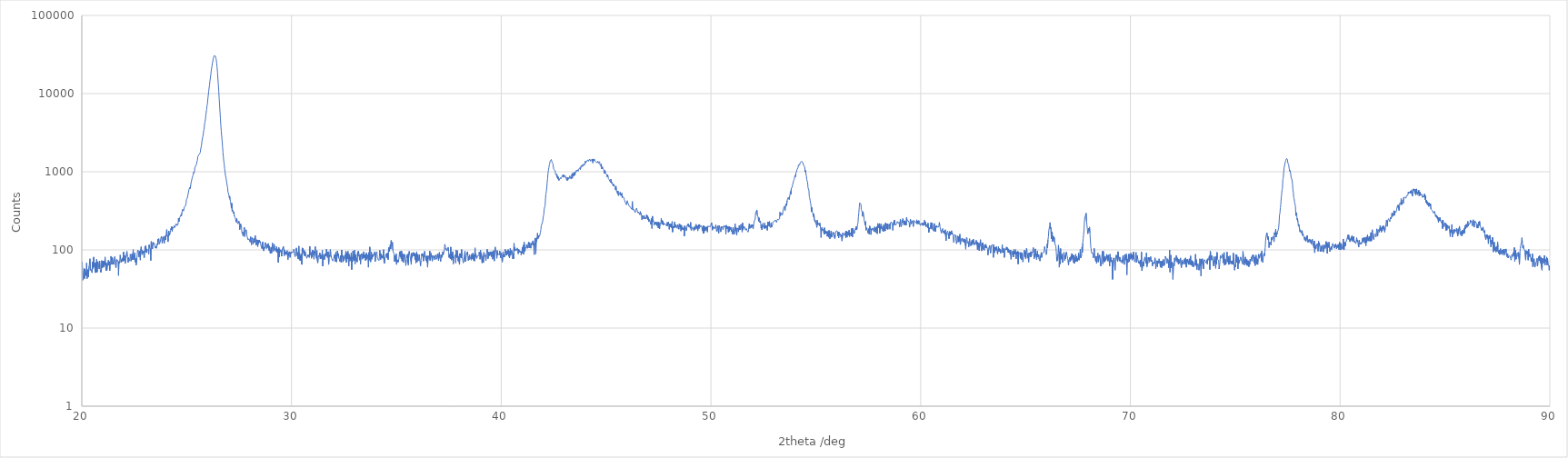
| Category | [Measurement conditions] |
|---|---|
| 20.01 | 71 |
| 20.03 | 64 |
| 20.05 | 41 |
| 20.07 | 43 |
| 20.09 | 53 |
| 20.11 | 58 |
| 20.13 | 43 |
| 20.15 | 57 |
| 20.17 | 56 |
| 20.19 | 47 |
| 20.21 | 52 |
| 20.23 | 68 |
| 20.25 | 43 |
| 20.27 | 50 |
| 20.29 | 56 |
| 20.31 | 45 |
| 20.33 | 44 |
| 20.35 | 62 |
| 20.37 | 62 |
| 20.39 | 77 |
| 20.41 | 55 |
| 20.43 | 57 |
| 20.45 | 55 |
| 20.47 | 55 |
| 20.49 | 51 |
| 20.51 | 70 |
| 20.53 | 58 |
| 20.55 | 58 |
| 20.57 | 81 |
| 20.59 | 61 |
| 20.61 | 68 |
| 20.63 | 54 |
| 20.65 | 51 |
| 20.67 | 69 |
| 20.69 | 52 |
| 20.71 | 76 |
| 20.73 | 52 |
| 20.75 | 69 |
| 20.77 | 71 |
| 20.79 | 62 |
| 20.81 | 59 |
| 20.83 | 57 |
| 20.85 | 72 |
| 20.87 | 60 |
| 20.89 | 52 |
| 20.91 | 54 |
| 20.93 | 52 |
| 20.95 | 73 |
| 20.97 | 70 |
| 20.99 | 59 |
| 21.01 | 59 |
| 21.03 | 72 |
| 21.05 | 61 |
| 21.07 | 71 |
| 21.09 | 64 |
| 21.11 | 81 |
| 21.13 | 64 |
| 21.15 | 54 |
| 21.17 | 68 |
| 21.19 | 54 |
| 21.21 | 58 |
| 21.23 | 61 |
| 21.25 | 71 |
| 21.27 | 74 |
| 21.29 | 64 |
| 21.31 | 71 |
| 21.33 | 54 |
| 21.35 | 61 |
| 21.37 | 67 |
| 21.39 | 83 |
| 21.41 | 72 |
| 21.43 | 65 |
| 21.45 | 80 |
| 21.47 | 77 |
| 21.49 | 71 |
| 21.51 | 65 |
| 21.53 | 71 |
| 21.55 | 70 |
| 21.57 | 82 |
| 21.59 | 76 |
| 21.61 | 62 |
| 21.63 | 59 |
| 21.65 | 75 |
| 21.67 | 74 |
| 21.69 | 76 |
| 21.71 | 74 |
| 21.73 | 70 |
| 21.75 | 47 |
| 21.77 | 71 |
| 21.79 | 68 |
| 21.81 | 72 |
| 21.83 | 86 |
| 21.85 | 77 |
| 21.87 | 69 |
| 21.89 | 68 |
| 21.91 | 76 |
| 21.93 | 72 |
| 21.95 | 79 |
| 21.97 | 71 |
| 21.99 | 94 |
| 22.01 | 73 |
| 22.03 | 85 |
| 22.05 | 81 |
| 22.07 | 67 |
| 22.09 | 78 |
| 22.11 | 77 |
| 22.13 | 76 |
| 22.15 | 96 |
| 22.17 | 82 |
| 22.19 | 76 |
| 22.21 | 69 |
| 22.23 | 80 |
| 22.25 | 75 |
| 22.27 | 75 |
| 22.29 | 72 |
| 22.31 | 88 |
| 22.33 | 85 |
| 22.35 | 72 |
| 22.37 | 80 |
| 22.39 | 89 |
| 22.41 | 75 |
| 22.43 | 88 |
| 22.45 | 101 |
| 22.47 | 75 |
| 22.49 | 83 |
| 22.51 | 81 |
| 22.53 | 92 |
| 22.55 | 70 |
| 22.57 | 77 |
| 22.59 | 64 |
| 22.61 | 63 |
| 22.63 | 79 |
| 22.65 | 93 |
| 22.67 | 100 |
| 22.69 | 95 |
| 22.71 | 92 |
| 22.73 | 81 |
| 22.75 | 97 |
| 22.77 | 87 |
| 22.79 | 74 |
| 22.81 | 102 |
| 22.83 | 110 |
| 22.85 | 97 |
| 22.87 | 87 |
| 22.89 | 98 |
| 22.91 | 93 |
| 22.93 | 90 |
| 22.95 | 97 |
| 22.97 | 79 |
| 22.99 | 83 |
| 23.01 | 110 |
| 23.03 | 94 |
| 23.05 | 114 |
| 23.07 | 115 |
| 23.09 | 92 |
| 23.11 | 102 |
| 23.13 | 100 |
| 23.15 | 104 |
| 23.17 | 98 |
| 23.19 | 88 |
| 23.21 | 116 |
| 23.23 | 107 |
| 23.25 | 109 |
| 23.27 | 103 |
| 23.29 | 73 |
| 23.31 | 128 |
| 23.33 | 119 |
| 23.35 | 121 |
| 23.37 | 103 |
| 23.39 | 125 |
| 23.41 | 126 |
| 23.43 | 118 |
| 23.45 | 122 |
| 23.47 | 125 |
| 23.49 | 120 |
| 23.51 | 106 |
| 23.53 | 111 |
| 23.55 | 105 |
| 23.57 | 113 |
| 23.59 | 119 |
| 23.61 | 115 |
| 23.63 | 137 |
| 23.65 | 131 |
| 23.67 | 139 |
| 23.69 | 119 |
| 23.71 | 119 |
| 23.73 | 124 |
| 23.75 | 125 |
| 23.77 | 126 |
| 23.79 | 149 |
| 23.81 | 140 |
| 23.83 | 122 |
| 23.85 | 133 |
| 23.87 | 147 |
| 23.89 | 136 |
| 23.91 | 139 |
| 23.93 | 121 |
| 23.95 | 150 |
| 23.97 | 147 |
| 23.99 | 134 |
| 24.01 | 154 |
| 24.03 | 149 |
| 24.05 | 182 |
| 24.07 | 159 |
| 24.09 | 154 |
| 24.11 | 127 |
| 24.13 | 139 |
| 24.15 | 175 |
| 24.17 | 153 |
| 24.19 | 157 |
| 24.21 | 163 |
| 24.23 | 178 |
| 24.25 | 188 |
| 24.27 | 180 |
| 24.29 | 199 |
| 24.31 | 173 |
| 24.33 | 192 |
| 24.35 | 188 |
| 24.37 | 194 |
| 24.39 | 192 |
| 24.41 | 203 |
| 24.43 | 194 |
| 24.45 | 195 |
| 24.47 | 206 |
| 24.49 | 215 |
| 24.51 | 211 |
| 24.53 | 205 |
| 24.55 | 214 |
| 24.57 | 208 |
| 24.59 | 214 |
| 24.61 | 255 |
| 24.63 | 230 |
| 24.65 | 246 |
| 24.67 | 258 |
| 24.69 | 268 |
| 24.71 | 261 |
| 24.73 | 281 |
| 24.75 | 272 |
| 24.77 | 299 |
| 24.79 | 299 |
| 24.81 | 332 |
| 24.83 | 327 |
| 24.85 | 314 |
| 24.87 | 332 |
| 24.89 | 356 |
| 24.91 | 359 |
| 24.93 | 359 |
| 24.95 | 367 |
| 24.97 | 394 |
| 24.99 | 442 |
| 25.01 | 431 |
| 25.03 | 460 |
| 25.05 | 486 |
| 25.07 | 481 |
| 25.09 | 555 |
| 25.11 | 591 |
| 25.13 | 605 |
| 25.15 | 633 |
| 25.17 | 609 |
| 25.19 | 668 |
| 25.21 | 725 |
| 25.23 | 762 |
| 25.25 | 807 |
| 25.27 | 849 |
| 25.29 | 879 |
| 25.31 | 917 |
| 25.33 | 984 |
| 25.35 | 957 |
| 25.37 | 996 |
| 25.39 | 1117 |
| 25.41 | 1117 |
| 25.43 | 1198 |
| 25.45 | 1203 |
| 25.47 | 1243 |
| 25.49 | 1343 |
| 25.51 | 1389 |
| 25.53 | 1553 |
| 25.55 | 1524 |
| 25.57 | 1638 |
| 25.59 | 1653 |
| 25.61 | 1638 |
| 25.63 | 1721 |
| 25.65 | 1781 |
| 25.67 | 1957 |
| 25.69 | 2071 |
| 25.71 | 2221 |
| 25.73 | 2484 |
| 25.75 | 2547 |
| 25.77 | 2821 |
| 25.79 | 2992 |
| 25.81 | 3332 |
| 25.83 | 3493 |
| 25.85 | 3984 |
| 25.87 | 4290 |
| 25.89 | 4614 |
| 25.91 | 5135 |
| 25.93 | 5702 |
| 25.95 | 6243 |
| 25.97 | 6972 |
| 25.99 | 7399 |
| 26.01 | 8545 |
| 26.03 | 9480 |
| 26.05 | 10679 |
| 26.07 | 11734 |
| 26.09 | 12913 |
| 26.11 | 14489 |
| 26.13 | 15764 |
| 26.15 | 17408 |
| 26.17 | 19461 |
| 26.19 | 21064 |
| 26.21 | 22803 |
| 26.23 | 24775 |
| 26.25 | 26191 |
| 26.27 | 28034 |
| 26.29 | 29569 |
| 26.31 | 30521 |
| 26.33 | 30816 |
| 26.35 | 31015 |
| 26.37 | 30137 |
| 26.39 | 28872 |
| 26.41 | 27304 |
| 26.43 | 24660 |
| 26.45 | 21911 |
| 26.47 | 18752 |
| 26.49 | 15746 |
| 26.51 | 13172 |
| 26.53 | 10747 |
| 26.55 | 8644 |
| 26.57 | 7068 |
| 26.59 | 5837 |
| 26.61 | 4757 |
| 26.63 | 3893 |
| 26.65 | 3282 |
| 26.67 | 2836 |
| 26.69 | 2488 |
| 26.71 | 2101 |
| 26.73 | 1784 |
| 26.75 | 1542 |
| 26.77 | 1366 |
| 26.79 | 1253 |
| 26.81 | 1099 |
| 26.83 | 1005 |
| 26.85 | 896 |
| 26.87 | 849 |
| 26.89 | 790 |
| 26.91 | 727 |
| 26.93 | 737 |
| 26.95 | 628 |
| 26.97 | 552 |
| 26.99 | 539 |
| 27.01 | 509 |
| 27.03 | 468 |
| 27.05 | 487 |
| 27.07 | 439 |
| 27.09 | 416 |
| 27.11 | 382 |
| 27.13 | 342 |
| 27.15 | 396 |
| 27.17 | 311 |
| 27.19 | 325 |
| 27.21 | 311 |
| 27.23 | 294 |
| 27.25 | 308 |
| 27.27 | 271 |
| 27.29 | 278 |
| 27.31 | 261 |
| 27.33 | 247 |
| 27.35 | 228 |
| 27.37 | 241 |
| 27.39 | 254 |
| 27.41 | 223 |
| 27.43 | 226 |
| 27.45 | 216 |
| 27.47 | 214 |
| 27.49 | 233 |
| 27.51 | 218 |
| 27.53 | 181 |
| 27.55 | 185 |
| 27.57 | 216 |
| 27.59 | 221 |
| 27.61 | 205 |
| 27.63 | 169 |
| 27.65 | 162 |
| 27.67 | 170 |
| 27.69 | 150 |
| 27.71 | 162 |
| 27.73 | 170 |
| 27.75 | 194 |
| 27.77 | 148 |
| 27.79 | 162 |
| 27.81 | 170 |
| 27.83 | 181 |
| 27.85 | 174 |
| 27.87 | 153 |
| 27.89 | 146 |
| 27.91 | 149 |
| 27.93 | 134 |
| 27.95 | 135 |
| 27.97 | 139 |
| 27.99 | 142 |
| 28.01 | 138 |
| 28.03 | 126 |
| 28.05 | 147 |
| 28.07 | 138 |
| 28.09 | 116 |
| 28.11 | 132 |
| 28.13 | 143 |
| 28.15 | 136 |
| 28.17 | 119 |
| 28.19 | 126 |
| 28.21 | 139 |
| 28.23 | 124 |
| 28.25 | 143 |
| 28.27 | 153 |
| 28.29 | 127 |
| 28.31 | 115 |
| 28.33 | 122 |
| 28.35 | 135 |
| 28.37 | 116 |
| 28.39 | 110 |
| 28.41 | 134 |
| 28.43 | 120 |
| 28.45 | 129 |
| 28.47 | 134 |
| 28.49 | 124 |
| 28.51 | 128 |
| 28.53 | 127 |
| 28.55 | 111 |
| 28.57 | 111 |
| 28.59 | 104 |
| 28.61 | 122 |
| 28.63 | 127 |
| 28.65 | 102 |
| 28.67 | 97 |
| 28.69 | 97 |
| 28.71 | 109 |
| 28.73 | 105 |
| 28.75 | 124 |
| 28.77 | 119 |
| 28.79 | 115 |
| 28.81 | 104 |
| 28.83 | 117 |
| 28.85 | 107 |
| 28.87 | 110 |
| 28.89 | 121 |
| 28.91 | 102 |
| 28.93 | 98 |
| 28.95 | 112 |
| 28.97 | 114 |
| 28.99 | 90 |
| 29.01 | 100 |
| 29.03 | 108 |
| 29.05 | 91 |
| 29.07 | 90 |
| 29.09 | 122 |
| 29.11 | 104 |
| 29.13 | 101 |
| 29.15 | 96 |
| 29.17 | 118 |
| 29.19 | 108 |
| 29.21 | 110 |
| 29.23 | 99 |
| 29.25 | 103 |
| 29.27 | 96 |
| 29.29 | 110 |
| 29.31 | 93 |
| 29.33 | 92 |
| 29.35 | 103 |
| 29.37 | 69 |
| 29.39 | 108 |
| 29.41 | 81 |
| 29.43 | 103 |
| 29.45 | 101 |
| 29.47 | 95 |
| 29.49 | 99 |
| 29.51 | 100 |
| 29.53 | 83 |
| 29.55 | 100 |
| 29.57 | 99 |
| 29.59 | 99 |
| 29.61 | 111 |
| 29.63 | 100 |
| 29.65 | 84 |
| 29.67 | 100 |
| 29.69 | 98 |
| 29.71 | 87 |
| 29.73 | 94 |
| 29.75 | 88 |
| 29.77 | 86 |
| 29.79 | 98 |
| 29.81 | 84 |
| 29.83 | 75 |
| 29.85 | 92 |
| 29.87 | 83 |
| 29.89 | 95 |
| 29.91 | 92 |
| 29.93 | 80 |
| 29.95 | 82 |
| 29.97 | 94 |
| 29.99 | 91 |
| 30.01 | 95 |
| 30.03 | 93 |
| 30.05 | 92 |
| 30.07 | 93 |
| 30.09 | 96 |
| 30.11 | 102 |
| 30.13 | 93 |
| 30.15 | 92 |
| 30.17 | 82 |
| 30.19 | 89 |
| 30.21 | 100 |
| 30.23 | 106 |
| 30.25 | 98 |
| 30.27 | 84 |
| 30.29 | 93 |
| 30.31 | 77 |
| 30.33 | 83 |
| 30.35 | 112 |
| 30.37 | 76 |
| 30.39 | 90 |
| 30.41 | 73 |
| 30.43 | 85 |
| 30.45 | 79 |
| 30.47 | 88 |
| 30.49 | 65 |
| 30.51 | 106 |
| 30.53 | 95 |
| 30.55 | 105 |
| 30.57 | 103 |
| 30.59 | 88 |
| 30.61 | 98 |
| 30.63 | 83 |
| 30.65 | 94 |
| 30.67 | 91 |
| 30.69 | 93 |
| 30.71 | 81 |
| 30.73 | 78 |
| 30.75 | 79 |
| 30.77 | 86 |
| 30.79 | 82 |
| 30.81 | 81 |
| 30.83 | 87 |
| 30.85 | 80 |
| 30.87 | 111 |
| 30.89 | 86 |
| 30.91 | 86 |
| 30.93 | 89 |
| 30.95 | 78 |
| 30.97 | 94 |
| 30.99 | 82 |
| 31.01 | 100 |
| 31.03 | 92 |
| 31.05 | 84 |
| 31.07 | 76 |
| 31.09 | 96 |
| 31.11 | 91 |
| 31.13 | 110 |
| 31.15 | 85 |
| 31.17 | 81 |
| 31.19 | 78 |
| 31.21 | 98 |
| 31.23 | 73 |
| 31.25 | 68 |
| 31.27 | 78 |
| 31.29 | 85 |
| 31.31 | 82 |
| 31.33 | 80 |
| 31.35 | 92 |
| 31.37 | 77 |
| 31.39 | 87 |
| 31.41 | 81 |
| 31.43 | 77 |
| 31.45 | 86 |
| 31.47 | 99 |
| 31.49 | 62 |
| 31.51 | 79 |
| 31.53 | 87 |
| 31.55 | 84 |
| 31.57 | 75 |
| 31.59 | 84 |
| 31.61 | 90 |
| 31.63 | 92 |
| 31.65 | 83 |
| 31.67 | 102 |
| 31.69 | 87 |
| 31.71 | 80 |
| 31.73 | 78 |
| 31.75 | 95 |
| 31.77 | 65 |
| 31.79 | 76 |
| 31.81 | 86 |
| 31.83 | 82 |
| 31.85 | 101 |
| 31.87 | 91 |
| 31.89 | 89 |
| 31.91 | 78 |
| 31.93 | 77 |
| 31.95 | 74 |
| 31.97 | 72 |
| 31.99 | 75 |
| 32.01 | 78 |
| 32.03 | 79 |
| 32.05 | 87 |
| 32.07 | 86 |
| 32.09 | 71 |
| 32.11 | 93 |
| 32.13 | 80 |
| 32.15 | 70 |
| 32.17 | 70 |
| 32.19 | 97 |
| 32.21 | 83 |
| 32.23 | 90 |
| 32.25 | 79 |
| 32.27 | 77 |
| 32.29 | 75 |
| 32.31 | 71 |
| 32.33 | 85 |
| 32.35 | 87 |
| 32.37 | 69 |
| 32.39 | 100 |
| 32.41 | 88 |
| 32.43 | 89 |
| 32.45 | 70 |
| 32.47 | 84 |
| 32.49 | 75 |
| 32.51 | 73 |
| 32.53 | 77 |
| 32.55 | 86 |
| 32.57 | 78 |
| 32.59 | 96 |
| 32.61 | 69 |
| 32.63 | 82 |
| 32.65 | 93 |
| 32.67 | 77 |
| 32.69 | 96 |
| 32.71 | 76 |
| 32.73 | 62 |
| 32.75 | 88 |
| 32.77 | 77 |
| 32.79 | 72 |
| 32.81 | 81 |
| 32.83 | 77 |
| 32.85 | 92 |
| 32.87 | 56 |
| 32.89 | 80 |
| 32.91 | 71 |
| 32.93 | 97 |
| 32.95 | 77 |
| 32.97 | 85 |
| 32.99 | 73 |
| 33.01 | 99 |
| 33.03 | 66 |
| 33.05 | 87 |
| 33.07 | 79 |
| 33.09 | 73 |
| 33.11 | 78 |
| 33.13 | 70 |
| 33.15 | 93 |
| 33.17 | 83 |
| 33.19 | 97 |
| 33.21 | 90 |
| 33.23 | 81 |
| 33.25 | 74 |
| 33.27 | 87 |
| 33.29 | 66 |
| 33.31 | 85 |
| 33.33 | 85 |
| 33.35 | 90 |
| 33.37 | 80 |
| 33.39 | 76 |
| 33.41 | 77 |
| 33.43 | 78 |
| 33.45 | 95 |
| 33.47 | 79 |
| 33.49 | 82 |
| 33.51 | 87 |
| 33.53 | 73 |
| 33.55 | 88 |
| 33.57 | 92 |
| 33.59 | 76 |
| 33.61 | 75 |
| 33.63 | 83 |
| 33.65 | 87 |
| 33.67 | 60 |
| 33.69 | 93 |
| 33.71 | 74 |
| 33.73 | 109 |
| 33.75 | 94 |
| 33.77 | 70 |
| 33.79 | 79 |
| 33.81 | 94 |
| 33.83 | 76 |
| 33.85 | 86 |
| 33.87 | 81 |
| 33.89 | 79 |
| 33.91 | 88 |
| 33.93 | 85 |
| 33.95 | 83 |
| 33.97 | 95 |
| 33.99 | 71 |
| 34.01 | 89 |
| 34.03 | 91 |
| 34.05 | 87 |
| 34.07 | 95 |
| 34.09 | 80 |
| 34.11 | 77 |
| 34.13 | 75 |
| 34.15 | 75 |
| 34.17 | 73 |
| 34.19 | 82 |
| 34.21 | 99 |
| 34.23 | 85 |
| 34.25 | 75 |
| 34.27 | 89 |
| 34.29 | 79 |
| 34.31 | 79 |
| 34.33 | 84 |
| 34.35 | 78 |
| 34.37 | 89 |
| 34.39 | 101 |
| 34.41 | 70 |
| 34.43 | 67 |
| 34.45 | 76 |
| 34.47 | 75 |
| 34.49 | 85 |
| 34.51 | 89 |
| 34.53 | 91 |
| 34.55 | 79 |
| 34.57 | 91 |
| 34.59 | 92 |
| 34.61 | 75 |
| 34.63 | 107 |
| 34.65 | 106 |
| 34.67 | 95 |
| 34.69 | 110 |
| 34.71 | 117 |
| 34.73 | 103 |
| 34.75 | 132 |
| 34.77 | 126 |
| 34.79 | 112 |
| 34.81 | 125 |
| 34.83 | 99 |
| 34.85 | 98 |
| 34.87 | 101 |
| 34.89 | 88 |
| 34.91 | 71 |
| 34.93 | 84 |
| 34.95 | 81 |
| 34.97 | 71 |
| 34.99 | 89 |
| 35.01 | 65 |
| 35.03 | 75 |
| 35.05 | 70 |
| 35.07 | 74 |
| 35.09 | 70 |
| 35.11 | 75 |
| 35.13 | 81 |
| 35.15 | 95 |
| 35.17 | 95 |
| 35.19 | 81 |
| 35.21 | 96 |
| 35.23 | 77 |
| 35.25 | 96 |
| 35.27 | 72 |
| 35.29 | 86 |
| 35.31 | 89 |
| 35.33 | 69 |
| 35.35 | 79 |
| 35.37 | 85 |
| 35.39 | 88 |
| 35.41 | 81 |
| 35.43 | 83 |
| 35.45 | 63 |
| 35.47 | 75 |
| 35.49 | 84 |
| 35.51 | 79 |
| 35.53 | 88 |
| 35.55 | 69 |
| 35.57 | 64 |
| 35.59 | 90 |
| 35.61 | 96 |
| 35.63 | 89 |
| 35.65 | 84 |
| 35.67 | 84 |
| 35.69 | 83 |
| 35.71 | 65 |
| 35.73 | 91 |
| 35.75 | 80 |
| 35.77 | 87 |
| 35.79 | 86 |
| 35.81 | 93 |
| 35.83 | 83 |
| 35.85 | 91 |
| 35.87 | 86 |
| 35.89 | 75 |
| 35.91 | 90 |
| 35.93 | 68 |
| 35.95 | 83 |
| 35.97 | 95 |
| 35.99 | 70 |
| 36.01 | 88 |
| 36.03 | 77 |
| 36.05 | 75 |
| 36.07 | 73 |
| 36.09 | 87 |
| 36.11 | 75 |
| 36.13 | 70 |
| 36.15 | 62 |
| 36.17 | 73 |
| 36.19 | 82 |
| 36.21 | 89 |
| 36.23 | 84 |
| 36.25 | 90 |
| 36.27 | 91 |
| 36.29 | 72 |
| 36.31 | 84 |
| 36.33 | 81 |
| 36.35 | 96 |
| 36.37 | 87 |
| 36.39 | 86 |
| 36.41 | 73 |
| 36.43 | 83 |
| 36.45 | 70 |
| 36.47 | 84 |
| 36.49 | 60 |
| 36.51 | 81 |
| 36.53 | 84 |
| 36.55 | 79 |
| 36.57 | 76 |
| 36.59 | 97 |
| 36.61 | 73 |
| 36.63 | 78 |
| 36.65 | 91 |
| 36.67 | 82 |
| 36.69 | 85 |
| 36.71 | 72 |
| 36.73 | 77 |
| 36.75 | 79 |
| 36.77 | 85 |
| 36.79 | 87 |
| 36.81 | 84 |
| 36.83 | 75 |
| 36.85 | 84 |
| 36.87 | 86 |
| 36.89 | 87 |
| 36.91 | 76 |
| 36.93 | 80 |
| 36.95 | 86 |
| 36.97 | 89 |
| 36.99 | 79 |
| 37.01 | 73 |
| 37.03 | 88 |
| 37.05 | 93 |
| 37.07 | 79 |
| 37.09 | 76 |
| 37.11 | 71 |
| 37.13 | 87 |
| 37.15 | 84 |
| 37.17 | 80 |
| 37.19 | 85 |
| 37.21 | 95 |
| 37.23 | 86 |
| 37.25 | 90 |
| 37.27 | 91 |
| 37.29 | 101 |
| 37.31 | 118 |
| 37.33 | 110 |
| 37.35 | 101 |
| 37.37 | 105 |
| 37.39 | 107 |
| 37.41 | 97 |
| 37.43 | 99 |
| 37.45 | 102 |
| 37.47 | 108 |
| 37.49 | 94 |
| 37.51 | 80 |
| 37.53 | 88 |
| 37.55 | 80 |
| 37.57 | 77 |
| 37.59 | 109 |
| 37.61 | 107 |
| 37.63 | 74 |
| 37.65 | 89 |
| 37.67 | 78 |
| 37.69 | 95 |
| 37.71 | 66 |
| 37.73 | 75 |
| 37.75 | 81 |
| 37.77 | 82 |
| 37.79 | 82 |
| 37.81 | 87 |
| 37.83 | 68 |
| 37.85 | 99 |
| 37.87 | 80 |
| 37.89 | 84 |
| 37.91 | 98 |
| 37.93 | 99 |
| 37.95 | 72 |
| 37.97 | 82 |
| 37.99 | 70 |
| 38.01 | 65 |
| 38.03 | 90 |
| 38.05 | 81 |
| 38.07 | 90 |
| 38.09 | 79 |
| 38.11 | 101 |
| 38.13 | 82 |
| 38.15 | 81 |
| 38.17 | 80 |
| 38.19 | 68 |
| 38.21 | 70 |
| 38.23 | 81 |
| 38.25 | 83 |
| 38.27 | 97 |
| 38.29 | 71 |
| 38.31 | 73 |
| 38.33 | 72 |
| 38.35 | 92 |
| 38.37 | 89 |
| 38.39 | 95 |
| 38.41 | 85 |
| 38.43 | 73 |
| 38.45 | 82 |
| 38.47 | 75 |
| 38.49 | 86 |
| 38.51 | 82 |
| 38.53 | 80 |
| 38.55 | 81 |
| 38.57 | 74 |
| 38.59 | 88 |
| 38.61 | 77 |
| 38.63 | 88 |
| 38.65 | 91 |
| 38.67 | 74 |
| 38.69 | 82 |
| 38.71 | 87 |
| 38.73 | 72 |
| 38.75 | 106 |
| 38.77 | 82 |
| 38.79 | 88 |
| 38.81 | 90 |
| 38.83 | 78 |
| 38.85 | 81 |
| 38.87 | 84 |
| 38.89 | 84 |
| 38.91 | 84 |
| 38.93 | 85 |
| 38.95 | 94 |
| 38.97 | 86 |
| 38.99 | 76 |
| 39.01 | 100 |
| 39.03 | 81 |
| 39.05 | 91 |
| 39.07 | 90 |
| 39.09 | 68 |
| 39.11 | 80 |
| 39.13 | 84 |
| 39.15 | 69 |
| 39.17 | 93 |
| 39.19 | 89 |
| 39.21 | 91 |
| 39.23 | 90 |
| 39.25 | 80 |
| 39.27 | 73 |
| 39.29 | 88 |
| 39.31 | 90 |
| 39.33 | 102 |
| 39.35 | 95 |
| 39.37 | 77 |
| 39.39 | 76 |
| 39.41 | 94 |
| 39.43 | 84 |
| 39.45 | 92 |
| 39.47 | 87 |
| 39.49 | 95 |
| 39.51 | 85 |
| 39.53 | 82 |
| 39.55 | 95 |
| 39.57 | 88 |
| 39.59 | 76 |
| 39.61 | 74 |
| 39.63 | 98 |
| 39.65 | 81 |
| 39.67 | 72 |
| 39.69 | 97 |
| 39.71 | 109 |
| 39.73 | 97 |
| 39.75 | 94 |
| 39.77 | 90 |
| 39.79 | 78 |
| 39.81 | 98 |
| 39.83 | 86 |
| 39.85 | 87 |
| 39.87 | 89 |
| 39.89 | 89 |
| 39.91 | 86 |
| 39.93 | 97 |
| 39.95 | 88 |
| 39.97 | 79 |
| 39.99 | 88 |
| 40.01 | 92 |
| 40.03 | 93 |
| 40.05 | 70 |
| 40.07 | 80 |
| 40.09 | 95 |
| 40.11 | 81 |
| 40.13 | 86 |
| 40.15 | 81 |
| 40.17 | 88 |
| 40.19 | 102 |
| 40.21 | 92 |
| 40.23 | 95 |
| 40.25 | 85 |
| 40.27 | 96 |
| 40.29 | 96 |
| 40.31 | 88 |
| 40.33 | 101 |
| 40.35 | 84 |
| 40.37 | 97 |
| 40.39 | 79 |
| 40.41 | 85 |
| 40.43 | 105 |
| 40.45 | 86 |
| 40.47 | 94 |
| 40.49 | 99 |
| 40.51 | 97 |
| 40.53 | 90 |
| 40.55 | 77 |
| 40.57 | 89 |
| 40.59 | 77 |
| 40.61 | 122 |
| 40.63 | 97 |
| 40.65 | 107 |
| 40.67 | 98 |
| 40.69 | 96 |
| 40.71 | 102 |
| 40.73 | 98 |
| 40.75 | 103 |
| 40.77 | 106 |
| 40.79 | 98 |
| 40.81 | 89 |
| 40.83 | 102 |
| 40.85 | 104 |
| 40.87 | 102 |
| 40.89 | 93 |
| 40.91 | 93 |
| 40.93 | 97 |
| 40.95 | 86 |
| 40.97 | 95 |
| 40.99 | 91 |
| 41.01 | 107 |
| 41.03 | 102 |
| 41.05 | 115 |
| 41.07 | 88 |
| 41.09 | 127 |
| 41.11 | 129 |
| 41.13 | 96 |
| 41.15 | 105 |
| 41.17 | 106 |
| 41.19 | 108 |
| 41.21 | 117 |
| 41.23 | 119 |
| 41.25 | 105 |
| 41.27 | 113 |
| 41.29 | 122 |
| 41.31 | 126 |
| 41.33 | 106 |
| 41.35 | 124 |
| 41.37 | 118 |
| 41.39 | 116 |
| 41.41 | 105 |
| 41.43 | 122 |
| 41.45 | 116 |
| 41.47 | 122 |
| 41.49 | 121 |
| 41.51 | 131 |
| 41.53 | 115 |
| 41.55 | 121 |
| 41.57 | 87 |
| 41.59 | 125 |
| 41.61 | 142 |
| 41.63 | 114 |
| 41.65 | 89 |
| 41.67 | 141 |
| 41.69 | 127 |
| 41.71 | 145 |
| 41.73 | 164 |
| 41.75 | 139 |
| 41.77 | 138 |
| 41.79 | 153 |
| 41.81 | 147 |
| 41.83 | 152 |
| 41.85 | 151 |
| 41.87 | 168 |
| 41.89 | 183 |
| 41.91 | 205 |
| 41.93 | 206 |
| 41.95 | 209 |
| 41.97 | 228 |
| 41.99 | 223 |
| 42.01 | 272 |
| 42.03 | 287 |
| 42.05 | 334 |
| 42.07 | 353 |
| 42.09 | 364 |
| 42.11 | 449 |
| 42.13 | 521 |
| 42.15 | 558 |
| 42.17 | 618 |
| 42.19 | 729 |
| 42.21 | 813 |
| 42.23 | 965 |
| 42.25 | 1042 |
| 42.27 | 1121 |
| 42.29 | 1215 |
| 42.31 | 1268 |
| 42.33 | 1356 |
| 42.35 | 1399 |
| 42.37 | 1416 |
| 42.39 | 1437 |
| 42.41 | 1350 |
| 42.43 | 1373 |
| 42.45 | 1291 |
| 42.47 | 1251 |
| 42.49 | 1116 |
| 42.51 | 1071 |
| 42.53 | 1067 |
| 42.55 | 1053 |
| 42.57 | 1024 |
| 42.59 | 937 |
| 42.61 | 951 |
| 42.63 | 899 |
| 42.65 | 932 |
| 42.67 | 842 |
| 42.69 | 879 |
| 42.71 | 806 |
| 42.73 | 855 |
| 42.75 | 774 |
| 42.77 | 780 |
| 42.79 | 811 |
| 42.81 | 807 |
| 42.83 | 842 |
| 42.85 | 813 |
| 42.87 | 843 |
| 42.89 | 842 |
| 42.91 | 863 |
| 42.93 | 906 |
| 42.95 | 866 |
| 42.97 | 914 |
| 42.99 | 848 |
| 43.01 | 843 |
| 43.03 | 844 |
| 43.05 | 892 |
| 43.07 | 852 |
| 43.09 | 817 |
| 43.11 | 796 |
| 43.13 | 775 |
| 43.15 | 852 |
| 43.17 | 774 |
| 43.19 | 796 |
| 43.21 | 839 |
| 43.23 | 812 |
| 43.25 | 794 |
| 43.27 | 885 |
| 43.29 | 885 |
| 43.31 | 888 |
| 43.33 | 805 |
| 43.35 | 869 |
| 43.37 | 928 |
| 43.39 | 826 |
| 43.41 | 958 |
| 43.43 | 932 |
| 43.45 | 879 |
| 43.47 | 941 |
| 43.49 | 990 |
| 43.51 | 899 |
| 43.53 | 949 |
| 43.55 | 948 |
| 43.57 | 964 |
| 43.59 | 1051 |
| 43.61 | 1013 |
| 43.63 | 1027 |
| 43.65 | 1060 |
| 43.67 | 1017 |
| 43.69 | 1071 |
| 43.71 | 1098 |
| 43.73 | 1081 |
| 43.75 | 1127 |
| 43.77 | 1066 |
| 43.79 | 1141 |
| 43.81 | 1193 |
| 43.83 | 1141 |
| 43.85 | 1131 |
| 43.87 | 1231 |
| 43.89 | 1228 |
| 43.91 | 1173 |
| 43.93 | 1265 |
| 43.95 | 1242 |
| 43.97 | 1219 |
| 43.99 | 1260 |
| 44.01 | 1365 |
| 44.03 | 1297 |
| 44.05 | 1284 |
| 44.07 | 1378 |
| 44.09 | 1349 |
| 44.11 | 1377 |
| 44.13 | 1413 |
| 44.15 | 1358 |
| 44.17 | 1384 |
| 44.19 | 1381 |
| 44.21 | 1452 |
| 44.23 | 1405 |
| 44.25 | 1363 |
| 44.27 | 1433 |
| 44.29 | 1424 |
| 44.31 | 1408 |
| 44.33 | 1384 |
| 44.35 | 1456 |
| 44.37 | 1296 |
| 44.39 | 1439 |
| 44.41 | 1380 |
| 44.43 | 1457 |
| 44.45 | 1382 |
| 44.47 | 1398 |
| 44.49 | 1414 |
| 44.51 | 1339 |
| 44.53 | 1372 |
| 44.55 | 1369 |
| 44.57 | 1306 |
| 44.59 | 1338 |
| 44.61 | 1369 |
| 44.63 | 1284 |
| 44.65 | 1314 |
| 44.67 | 1251 |
| 44.69 | 1348 |
| 44.71 | 1223 |
| 44.73 | 1226 |
| 44.75 | 1172 |
| 44.77 | 1269 |
| 44.79 | 1086 |
| 44.81 | 1109 |
| 44.83 | 1151 |
| 44.85 | 1106 |
| 44.87 | 1130 |
| 44.89 | 1063 |
| 44.91 | 949 |
| 44.93 | 987 |
| 44.95 | 1037 |
| 44.97 | 956 |
| 44.99 | 972 |
| 45.01 | 960 |
| 45.03 | 914 |
| 45.05 | 859 |
| 45.07 | 919 |
| 45.09 | 894 |
| 45.11 | 814 |
| 45.13 | 801 |
| 45.15 | 790 |
| 45.17 | 763 |
| 45.19 | 772 |
| 45.21 | 731 |
| 45.23 | 806 |
| 45.25 | 718 |
| 45.27 | 743 |
| 45.29 | 718 |
| 45.31 | 681 |
| 45.33 | 701 |
| 45.35 | 653 |
| 45.37 | 690 |
| 45.39 | 703 |
| 45.41 | 645 |
| 45.43 | 622 |
| 45.45 | 588 |
| 45.47 | 655 |
| 45.49 | 576 |
| 45.51 | 552 |
| 45.53 | 564 |
| 45.55 | 520 |
| 45.57 | 569 |
| 45.59 | 495 |
| 45.61 | 511 |
| 45.63 | 502 |
| 45.65 | 525 |
| 45.67 | 548 |
| 45.69 | 507 |
| 45.71 | 491 |
| 45.73 | 498 |
| 45.75 | 533 |
| 45.77 | 464 |
| 45.79 | 475 |
| 45.81 | 480 |
| 45.83 | 468 |
| 45.85 | 463 |
| 45.87 | 441 |
| 45.89 | 426 |
| 45.91 | 407 |
| 45.93 | 400 |
| 45.95 | 417 |
| 45.97 | 378 |
| 45.99 | 412 |
| 46.01 | 427 |
| 46.03 | 403 |
| 46.05 | 394 |
| 46.07 | 406 |
| 46.09 | 367 |
| 46.11 | 368 |
| 46.13 | 364 |
| 46.15 | 356 |
| 46.17 | 345 |
| 46.19 | 338 |
| 46.21 | 354 |
| 46.23 | 331 |
| 46.25 | 417 |
| 46.27 | 326 |
| 46.29 | 333 |
| 46.31 | 332 |
| 46.33 | 329 |
| 46.35 | 315 |
| 46.37 | 314 |
| 46.39 | 301 |
| 46.41 | 321 |
| 46.43 | 331 |
| 46.45 | 342 |
| 46.47 | 332 |
| 46.49 | 309 |
| 46.51 | 313 |
| 46.53 | 296 |
| 46.55 | 306 |
| 46.57 | 302 |
| 46.59 | 312 |
| 46.61 | 281 |
| 46.63 | 310 |
| 46.65 | 287 |
| 46.67 | 295 |
| 46.69 | 270 |
| 46.71 | 243 |
| 46.73 | 276 |
| 46.75 | 261 |
| 46.77 | 267 |
| 46.79 | 248 |
| 46.81 | 276 |
| 46.83 | 266 |
| 46.85 | 249 |
| 46.87 | 259 |
| 46.89 | 256 |
| 46.91 | 249 |
| 46.93 | 282 |
| 46.95 | 257 |
| 46.97 | 275 |
| 46.99 | 244 |
| 47.01 | 263 |
| 47.03 | 229 |
| 47.05 | 233 |
| 47.07 | 245 |
| 47.09 | 247 |
| 47.11 | 224 |
| 47.13 | 212 |
| 47.15 | 236 |
| 47.17 | 253 |
| 47.19 | 188 |
| 47.21 | 270 |
| 47.23 | 230 |
| 47.25 | 238 |
| 47.27 | 228 |
| 47.29 | 207 |
| 47.31 | 209 |
| 47.33 | 226 |
| 47.35 | 223 |
| 47.37 | 211 |
| 47.39 | 228 |
| 47.41 | 233 |
| 47.43 | 204 |
| 47.45 | 217 |
| 47.47 | 226 |
| 47.49 | 190 |
| 47.51 | 226 |
| 47.53 | 215 |
| 47.55 | 186 |
| 47.57 | 221 |
| 47.59 | 217 |
| 47.61 | 213 |
| 47.63 | 253 |
| 47.65 | 224 |
| 47.67 | 238 |
| 47.69 | 213 |
| 47.71 | 233 |
| 47.73 | 208 |
| 47.75 | 221 |
| 47.77 | 226 |
| 47.79 | 214 |
| 47.81 | 212 |
| 47.83 | 210 |
| 47.85 | 211 |
| 47.87 | 212 |
| 47.89 | 202 |
| 47.91 | 225 |
| 47.93 | 203 |
| 47.95 | 214 |
| 47.97 | 229 |
| 47.99 | 209 |
| 48.01 | 183 |
| 48.03 | 216 |
| 48.05 | 196 |
| 48.07 | 199 |
| 48.09 | 216 |
| 48.11 | 197 |
| 48.13 | 190 |
| 48.15 | 231 |
| 48.17 | 169 |
| 48.19 | 200 |
| 48.21 | 201 |
| 48.23 | 190 |
| 48.25 | 195 |
| 48.27 | 229 |
| 48.29 | 194 |
| 48.31 | 192 |
| 48.33 | 210 |
| 48.35 | 194 |
| 48.37 | 198 |
| 48.39 | 188 |
| 48.41 | 211 |
| 48.43 | 215 |
| 48.45 | 214 |
| 48.47 | 184 |
| 48.49 | 214 |
| 48.51 | 199 |
| 48.53 | 212 |
| 48.55 | 187 |
| 48.57 | 174 |
| 48.59 | 207 |
| 48.61 | 202 |
| 48.63 | 205 |
| 48.65 | 180 |
| 48.67 | 188 |
| 48.69 | 180 |
| 48.71 | 196 |
| 48.73 | 150 |
| 48.75 | 204 |
| 48.77 | 203 |
| 48.79 | 192 |
| 48.81 | 180 |
| 48.83 | 175 |
| 48.85 | 191 |
| 48.87 | 207 |
| 48.89 | 214 |
| 48.91 | 201 |
| 48.93 | 214 |
| 48.95 | 197 |
| 48.97 | 195 |
| 48.99 | 207 |
| 49.01 | 191 |
| 49.03 | 225 |
| 49.05 | 182 |
| 49.07 | 177 |
| 49.09 | 187 |
| 49.11 | 196 |
| 49.13 | 199 |
| 49.15 | 197 |
| 49.17 | 181 |
| 49.19 | 175 |
| 49.21 | 197 |
| 49.23 | 192 |
| 49.25 | 183 |
| 49.27 | 203 |
| 49.29 | 213 |
| 49.31 | 188 |
| 49.33 | 189 |
| 49.35 | 204 |
| 49.37 | 175 |
| 49.39 | 189 |
| 49.41 | 210 |
| 49.43 | 188 |
| 49.45 | 212 |
| 49.47 | 207 |
| 49.49 | 198 |
| 49.51 | 198 |
| 49.53 | 193 |
| 49.55 | 204 |
| 49.57 | 191 |
| 49.59 | 175 |
| 49.61 | 196 |
| 49.63 | 163 |
| 49.65 | 205 |
| 49.67 | 164 |
| 49.69 | 198 |
| 49.71 | 175 |
| 49.73 | 196 |
| 49.75 | 192 |
| 49.77 | 178 |
| 49.79 | 197 |
| 49.81 | 185 |
| 49.83 | 169 |
| 49.85 | 201 |
| 49.87 | 205 |
| 49.89 | 204 |
| 49.91 | 200 |
| 49.93 | 199 |
| 49.95 | 199 |
| 49.97 | 198 |
| 49.99 | 195 |
| 50.01 | 201 |
| 50.03 | 223 |
| 50.05 | 206 |
| 50.07 | 179 |
| 50.09 | 201 |
| 50.11 | 187 |
| 50.13 | 196 |
| 50.15 | 193 |
| 50.17 | 199 |
| 50.19 | 187 |
| 50.21 | 189 |
| 50.23 | 209 |
| 50.25 | 191 |
| 50.27 | 173 |
| 50.29 | 180 |
| 50.31 | 195 |
| 50.33 | 203 |
| 50.35 | 172 |
| 50.37 | 163 |
| 50.39 | 206 |
| 50.41 | 200 |
| 50.43 | 201 |
| 50.45 | 205 |
| 50.47 | 170 |
| 50.49 | 200 |
| 50.51 | 191 |
| 50.53 | 192 |
| 50.55 | 198 |
| 50.57 | 182 |
| 50.59 | 192 |
| 50.61 | 204 |
| 50.63 | 205 |
| 50.65 | 195 |
| 50.67 | 190 |
| 50.69 | 204 |
| 50.71 | 158 |
| 50.73 | 207 |
| 50.75 | 210 |
| 50.77 | 187 |
| 50.79 | 199 |
| 50.81 | 187 |
| 50.83 | 168 |
| 50.85 | 198 |
| 50.87 | 171 |
| 50.89 | 198 |
| 50.91 | 181 |
| 50.93 | 179 |
| 50.95 | 194 |
| 50.97 | 173 |
| 50.99 | 178 |
| 51.01 | 181 |
| 51.03 | 158 |
| 51.05 | 193 |
| 51.07 | 197 |
| 51.09 | 164 |
| 51.11 | 158 |
| 51.13 | 160 |
| 51.15 | 215 |
| 51.17 | 177 |
| 51.19 | 192 |
| 51.21 | 187 |
| 51.23 | 155 |
| 51.25 | 191 |
| 51.27 | 195 |
| 51.29 | 184 |
| 51.31 | 170 |
| 51.33 | 190 |
| 51.35 | 206 |
| 51.37 | 180 |
| 51.39 | 188 |
| 51.41 | 182 |
| 51.43 | 212 |
| 51.45 | 205 |
| 51.47 | 182 |
| 51.49 | 169 |
| 51.51 | 221 |
| 51.53 | 180 |
| 51.55 | 198 |
| 51.57 | 191 |
| 51.59 | 199 |
| 51.61 | 201 |
| 51.63 | 184 |
| 51.65 | 179 |
| 51.67 | 175 |
| 51.69 | 188 |
| 51.71 | 179 |
| 51.73 | 181 |
| 51.75 | 178 |
| 51.77 | 169 |
| 51.79 | 175 |
| 51.81 | 209 |
| 51.83 | 217 |
| 51.85 | 188 |
| 51.87 | 195 |
| 51.89 | 198 |
| 51.91 | 210 |
| 51.93 | 193 |
| 51.95 | 198 |
| 51.97 | 210 |
| 51.99 | 203 |
| 52.01 | 185 |
| 52.03 | 212 |
| 52.05 | 218 |
| 52.07 | 236 |
| 52.09 | 231 |
| 52.11 | 248 |
| 52.13 | 301 |
| 52.15 | 309 |
| 52.17 | 315 |
| 52.19 | 325 |
| 52.21 | 279 |
| 52.23 | 280 |
| 52.25 | 264 |
| 52.27 | 233 |
| 52.29 | 258 |
| 52.31 | 250 |
| 52.33 | 224 |
| 52.35 | 235 |
| 52.37 | 223 |
| 52.39 | 190 |
| 52.41 | 207 |
| 52.43 | 180 |
| 52.45 | 210 |
| 52.47 | 207 |
| 52.49 | 220 |
| 52.51 | 194 |
| 52.53 | 202 |
| 52.55 | 188 |
| 52.57 | 220 |
| 52.59 | 189 |
| 52.61 | 198 |
| 52.63 | 205 |
| 52.65 | 194 |
| 52.67 | 206 |
| 52.69 | 178 |
| 52.71 | 228 |
| 52.73 | 213 |
| 52.75 | 225 |
| 52.77 | 201 |
| 52.79 | 231 |
| 52.81 | 199 |
| 52.83 | 203 |
| 52.85 | 192 |
| 52.87 | 221 |
| 52.89 | 196 |
| 52.91 | 199 |
| 52.93 | 208 |
| 52.95 | 227 |
| 52.97 | 226 |
| 52.99 | 226 |
| 53.01 | 230 |
| 53.03 | 227 |
| 53.05 | 235 |
| 53.07 | 242 |
| 53.09 | 241 |
| 53.11 | 239 |
| 53.13 | 225 |
| 53.15 | 239 |
| 53.17 | 241 |
| 53.19 | 249 |
| 53.21 | 242 |
| 53.23 | 245 |
| 53.25 | 245 |
| 53.27 | 250 |
| 53.29 | 304 |
| 53.31 | 271 |
| 53.33 | 283 |
| 53.35 | 288 |
| 53.37 | 296 |
| 53.39 | 289 |
| 53.41 | 280 |
| 53.43 | 309 |
| 53.45 | 302 |
| 53.47 | 346 |
| 53.49 | 342 |
| 53.51 | 363 |
| 53.53 | 318 |
| 53.55 | 362 |
| 53.57 | 388 |
| 53.59 | 393 |
| 53.61 | 367 |
| 53.63 | 426 |
| 53.65 | 446 |
| 53.67 | 440 |
| 53.69 | 472 |
| 53.71 | 462 |
| 53.73 | 440 |
| 53.75 | 483 |
| 53.77 | 511 |
| 53.79 | 559 |
| 53.81 | 515 |
| 53.83 | 613 |
| 53.85 | 598 |
| 53.87 | 635 |
| 53.89 | 673 |
| 53.91 | 689 |
| 53.93 | 750 |
| 53.95 | 734 |
| 53.97 | 800 |
| 53.99 | 809 |
| 54.01 | 899 |
| 54.03 | 865 |
| 54.05 | 949 |
| 54.07 | 988 |
| 54.09 | 1002 |
| 54.11 | 1080 |
| 54.13 | 1091 |
| 54.15 | 1116 |
| 54.17 | 1224 |
| 54.19 | 1202 |
| 54.21 | 1257 |
| 54.23 | 1213 |
| 54.25 | 1303 |
| 54.27 | 1337 |
| 54.29 | 1291 |
| 54.31 | 1356 |
| 54.33 | 1331 |
| 54.35 | 1348 |
| 54.37 | 1331 |
| 54.39 | 1321 |
| 54.41 | 1226 |
| 54.43 | 1195 |
| 54.45 | 1197 |
| 54.47 | 1151 |
| 54.49 | 998 |
| 54.51 | 1038 |
| 54.53 | 931 |
| 54.55 | 890 |
| 54.57 | 790 |
| 54.59 | 803 |
| 54.61 | 728 |
| 54.63 | 621 |
| 54.65 | 607 |
| 54.67 | 585 |
| 54.69 | 479 |
| 54.71 | 461 |
| 54.73 | 429 |
| 54.75 | 396 |
| 54.77 | 371 |
| 54.79 | 307 |
| 54.81 | 348 |
| 54.83 | 315 |
| 54.85 | 319 |
| 54.87 | 318 |
| 54.89 | 265 |
| 54.91 | 289 |
| 54.93 | 242 |
| 54.95 | 231 |
| 54.97 | 241 |
| 54.99 | 223 |
| 55.01 | 228 |
| 55.03 | 208 |
| 55.05 | 194 |
| 55.07 | 239 |
| 55.09 | 210 |
| 55.11 | 221 |
| 55.13 | 216 |
| 55.15 | 209 |
| 55.17 | 203 |
| 55.19 | 221 |
| 55.21 | 210 |
| 55.23 | 179 |
| 55.25 | 144 |
| 55.27 | 186 |
| 55.29 | 194 |
| 55.31 | 178 |
| 55.33 | 180 |
| 55.35 | 183 |
| 55.37 | 183 |
| 55.39 | 160 |
| 55.41 | 192 |
| 55.43 | 159 |
| 55.45 | 165 |
| 55.47 | 176 |
| 55.49 | 162 |
| 55.51 | 163 |
| 55.53 | 172 |
| 55.55 | 149 |
| 55.57 | 172 |
| 55.59 | 164 |
| 55.61 | 145 |
| 55.63 | 178 |
| 55.65 | 157 |
| 55.67 | 138 |
| 55.69 | 160 |
| 55.71 | 153 |
| 55.73 | 175 |
| 55.75 | 145 |
| 55.77 | 144 |
| 55.79 | 157 |
| 55.81 | 168 |
| 55.83 | 162 |
| 55.85 | 167 |
| 55.87 | 147 |
| 55.89 | 146 |
| 55.91 | 139 |
| 55.93 | 156 |
| 55.95 | 172 |
| 55.97 | 172 |
| 55.99 | 173 |
| 56.01 | 176 |
| 56.03 | 171 |
| 56.05 | 151 |
| 56.07 | 170 |
| 56.09 | 142 |
| 56.11 | 168 |
| 56.13 | 155 |
| 56.15 | 159 |
| 56.17 | 161 |
| 56.19 | 147 |
| 56.21 | 150 |
| 56.23 | 156 |
| 56.25 | 130 |
| 56.27 | 129 |
| 56.29 | 166 |
| 56.31 | 159 |
| 56.33 | 159 |
| 56.35 | 161 |
| 56.37 | 153 |
| 56.39 | 167 |
| 56.41 | 157 |
| 56.43 | 143 |
| 56.45 | 175 |
| 56.47 | 159 |
| 56.49 | 145 |
| 56.51 | 171 |
| 56.53 | 166 |
| 56.55 | 153 |
| 56.57 | 151 |
| 56.59 | 179 |
| 56.61 | 148 |
| 56.63 | 166 |
| 56.65 | 158 |
| 56.67 | 163 |
| 56.69 | 151 |
| 56.71 | 188 |
| 56.73 | 158 |
| 56.75 | 146 |
| 56.77 | 190 |
| 56.79 | 175 |
| 56.81 | 174 |
| 56.83 | 162 |
| 56.85 | 174 |
| 56.87 | 177 |
| 56.89 | 188 |
| 56.91 | 182 |
| 56.93 | 199 |
| 56.95 | 180 |
| 56.97 | 195 |
| 56.99 | 211 |
| 57.01 | 221 |
| 57.03 | 264 |
| 57.05 | 296 |
| 57.07 | 347 |
| 57.09 | 401 |
| 57.11 | 406 |
| 57.13 | 404 |
| 57.15 | 386 |
| 57.17 | 329 |
| 57.19 | 323 |
| 57.21 | 304 |
| 57.23 | 268 |
| 57.25 | 309 |
| 57.27 | 289 |
| 57.29 | 272 |
| 57.31 | 241 |
| 57.33 | 222 |
| 57.35 | 209 |
| 57.37 | 231 |
| 57.39 | 179 |
| 57.41 | 175 |
| 57.43 | 192 |
| 57.45 | 182 |
| 57.47 | 186 |
| 57.49 | 164 |
| 57.51 | 181 |
| 57.53 | 188 |
| 57.55 | 158 |
| 57.57 | 202 |
| 57.59 | 193 |
| 57.61 | 179 |
| 57.63 | 157 |
| 57.65 | 186 |
| 57.67 | 179 |
| 57.69 | 184 |
| 57.71 | 191 |
| 57.73 | 186 |
| 57.75 | 178 |
| 57.77 | 171 |
| 57.79 | 170 |
| 57.81 | 197 |
| 57.83 | 192 |
| 57.85 | 168 |
| 57.87 | 192 |
| 57.89 | 184 |
| 57.91 | 197 |
| 57.93 | 161 |
| 57.95 | 218 |
| 57.97 | 190 |
| 57.99 | 187 |
| 58.01 | 192 |
| 58.03 | 218 |
| 58.05 | 164 |
| 58.07 | 202 |
| 58.09 | 184 |
| 58.11 | 216 |
| 58.13 | 189 |
| 58.15 | 186 |
| 58.17 | 197 |
| 58.19 | 174 |
| 58.21 | 208 |
| 58.23 | 209 |
| 58.25 | 172 |
| 58.27 | 176 |
| 58.29 | 214 |
| 58.31 | 175 |
| 58.33 | 223 |
| 58.35 | 214 |
| 58.37 | 197 |
| 58.39 | 187 |
| 58.41 | 217 |
| 58.43 | 182 |
| 58.45 | 190 |
| 58.47 | 199 |
| 58.49 | 214 |
| 58.51 | 205 |
| 58.53 | 184 |
| 58.55 | 217 |
| 58.57 | 213 |
| 58.59 | 228 |
| 58.61 | 223 |
| 58.63 | 217 |
| 58.65 | 205 |
| 58.67 | 178 |
| 58.69 | 205 |
| 58.71 | 228 |
| 58.73 | 206 |
| 58.75 | 242 |
| 58.77 | 215 |
| 58.79 | 220 |
| 58.81 | 206 |
| 58.83 | 201 |
| 58.85 | 219 |
| 58.87 | 216 |
| 58.89 | 231 |
| 58.91 | 233 |
| 58.93 | 219 |
| 58.95 | 216 |
| 58.97 | 227 |
| 58.99 | 196 |
| 59.01 | 216 |
| 59.03 | 247 |
| 59.05 | 213 |
| 59.07 | 198 |
| 59.09 | 209 |
| 59.11 | 238 |
| 59.13 | 223 |
| 59.15 | 251 |
| 59.17 | 236 |
| 59.19 | 210 |
| 59.21 | 215 |
| 59.23 | 236 |
| 59.25 | 208 |
| 59.27 | 231 |
| 59.29 | 231 |
| 59.31 | 208 |
| 59.33 | 262 |
| 59.35 | 237 |
| 59.37 | 240 |
| 59.39 | 232 |
| 59.41 | 236 |
| 59.43 | 238 |
| 59.45 | 224 |
| 59.47 | 195 |
| 59.49 | 214 |
| 59.51 | 248 |
| 59.53 | 243 |
| 59.55 | 214 |
| 59.57 | 224 |
| 59.59 | 228 |
| 59.61 | 237 |
| 59.63 | 217 |
| 59.65 | 199 |
| 59.67 | 238 |
| 59.69 | 244 |
| 59.71 | 230 |
| 59.73 | 227 |
| 59.75 | 231 |
| 59.77 | 226 |
| 59.79 | 220 |
| 59.81 | 243 |
| 59.83 | 215 |
| 59.85 | 211 |
| 59.87 | 236 |
| 59.89 | 216 |
| 59.91 | 237 |
| 59.93 | 219 |
| 59.95 | 221 |
| 59.97 | 215 |
| 59.99 | 205 |
| 60.01 | 219 |
| 60.03 | 219 |
| 60.05 | 216 |
| 60.07 | 208 |
| 60.09 | 223 |
| 60.11 | 222 |
| 60.13 | 205 |
| 60.15 | 219 |
| 60.17 | 221 |
| 60.19 | 240 |
| 60.21 | 209 |
| 60.23 | 227 |
| 60.25 | 198 |
| 60.27 | 200 |
| 60.29 | 210 |
| 60.31 | 205 |
| 60.33 | 192 |
| 60.35 | 220 |
| 60.37 | 215 |
| 60.39 | 167 |
| 60.41 | 185 |
| 60.43 | 193 |
| 60.45 | 187 |
| 60.47 | 206 |
| 60.49 | 224 |
| 60.51 | 196 |
| 60.53 | 184 |
| 60.55 | 221 |
| 60.57 | 189 |
| 60.59 | 180 |
| 60.61 | 181 |
| 60.63 | 173 |
| 60.65 | 218 |
| 60.67 | 179 |
| 60.69 | 185 |
| 60.71 | 171 |
| 60.73 | 202 |
| 60.75 | 194 |
| 60.77 | 204 |
| 60.79 | 198 |
| 60.81 | 200 |
| 60.83 | 203 |
| 60.85 | 196 |
| 60.87 | 205 |
| 60.89 | 225 |
| 60.91 | 206 |
| 60.93 | 209 |
| 60.95 | 178 |
| 60.97 | 170 |
| 60.99 | 164 |
| 61.01 | 180 |
| 61.03 | 177 |
| 61.05 | 188 |
| 61.07 | 171 |
| 61.09 | 165 |
| 61.11 | 174 |
| 61.13 | 175 |
| 61.15 | 160 |
| 61.17 | 181 |
| 61.19 | 183 |
| 61.21 | 131 |
| 61.23 | 163 |
| 61.25 | 169 |
| 61.27 | 167 |
| 61.29 | 174 |
| 61.31 | 157 |
| 61.33 | 162 |
| 61.35 | 139 |
| 61.37 | 172 |
| 61.39 | 159 |
| 61.41 | 153 |
| 61.43 | 171 |
| 61.45 | 159 |
| 61.47 | 176 |
| 61.49 | 158 |
| 61.51 | 165 |
| 61.53 | 165 |
| 61.55 | 152 |
| 61.57 | 125 |
| 61.59 | 129 |
| 61.61 | 157 |
| 61.63 | 159 |
| 61.65 | 161 |
| 61.67 | 154 |
| 61.69 | 128 |
| 61.71 | 120 |
| 61.73 | 128 |
| 61.75 | 151 |
| 61.77 | 145 |
| 61.79 | 126 |
| 61.81 | 149 |
| 61.83 | 127 |
| 61.85 | 148 |
| 61.87 | 159 |
| 61.89 | 117 |
| 61.91 | 127 |
| 61.93 | 124 |
| 61.95 | 138 |
| 61.97 | 142 |
| 61.99 | 131 |
| 62.01 | 127 |
| 62.03 | 124 |
| 62.05 | 139 |
| 62.07 | 125 |
| 62.09 | 124 |
| 62.11 | 137 |
| 62.13 | 115 |
| 62.15 | 102 |
| 62.17 | 134 |
| 62.19 | 145 |
| 62.21 | 140 |
| 62.23 | 122 |
| 62.25 | 119 |
| 62.27 | 128 |
| 62.29 | 109 |
| 62.31 | 121 |
| 62.33 | 139 |
| 62.35 | 118 |
| 62.37 | 115 |
| 62.39 | 112 |
| 62.41 | 128 |
| 62.43 | 115 |
| 62.45 | 133 |
| 62.47 | 134 |
| 62.49 | 120 |
| 62.51 | 137 |
| 62.53 | 127 |
| 62.55 | 115 |
| 62.57 | 125 |
| 62.59 | 124 |
| 62.61 | 125 |
| 62.63 | 119 |
| 62.65 | 133 |
| 62.67 | 117 |
| 62.69 | 127 |
| 62.71 | 101 |
| 62.73 | 124 |
| 62.75 | 122 |
| 62.77 | 125 |
| 62.79 | 98 |
| 62.81 | 121 |
| 62.83 | 117 |
| 62.85 | 135 |
| 62.87 | 111 |
| 62.89 | 112 |
| 62.91 | 97 |
| 62.93 | 122 |
| 62.95 | 108 |
| 62.97 | 124 |
| 62.99 | 102 |
| 63.01 | 105 |
| 63.03 | 99 |
| 63.05 | 116 |
| 63.07 | 118 |
| 63.09 | 107 |
| 63.11 | 118 |
| 63.13 | 106 |
| 63.15 | 110 |
| 63.17 | 110 |
| 63.19 | 101 |
| 63.21 | 86 |
| 63.23 | 101 |
| 63.25 | 103 |
| 63.27 | 110 |
| 63.29 | 114 |
| 63.31 | 100 |
| 63.33 | 91 |
| 63.35 | 96 |
| 63.37 | 114 |
| 63.39 | 113 |
| 63.41 | 115 |
| 63.43 | 117 |
| 63.45 | 103 |
| 63.47 | 80 |
| 63.49 | 117 |
| 63.51 | 99 |
| 63.53 | 92 |
| 63.55 | 108 |
| 63.57 | 107 |
| 63.59 | 99 |
| 63.61 | 110 |
| 63.63 | 99 |
| 63.65 | 97 |
| 63.67 | 88 |
| 63.69 | 103 |
| 63.71 | 110 |
| 63.73 | 95 |
| 63.75 | 104 |
| 63.77 | 97 |
| 63.79 | 102 |
| 63.81 | 91 |
| 63.83 | 98 |
| 63.85 | 97 |
| 63.87 | 101 |
| 63.89 | 117 |
| 63.91 | 92 |
| 63.93 | 98 |
| 63.95 | 105 |
| 63.97 | 102 |
| 63.99 | 80 |
| 64.01 | 88 |
| 64.03 | 104 |
| 64.05 | 103 |
| 64.07 | 100 |
| 64.09 | 109 |
| 64.11 | 100 |
| 64.13 | 107 |
| 64.15 | 96 |
| 64.17 | 93 |
| 64.19 | 103 |
| 64.21 | 92 |
| 64.23 | 92 |
| 64.25 | 99 |
| 64.27 | 87 |
| 64.29 | 99 |
| 64.31 | 76 |
| 64.33 | 83 |
| 64.35 | 87 |
| 64.37 | 93 |
| 64.39 | 97 |
| 64.41 | 87 |
| 64.43 | 81 |
| 64.45 | 102 |
| 64.47 | 88 |
| 64.49 | 87 |
| 64.51 | 95 |
| 64.53 | 101 |
| 64.55 | 77 |
| 64.57 | 94 |
| 64.59 | 88 |
| 64.61 | 87 |
| 64.63 | 96 |
| 64.65 | 66 |
| 64.67 | 94 |
| 64.69 | 95 |
| 64.71 | 95 |
| 64.73 | 88 |
| 64.75 | 78 |
| 64.77 | 93 |
| 64.79 | 94 |
| 64.81 | 75 |
| 64.83 | 92 |
| 64.85 | 86 |
| 64.87 | 70 |
| 64.89 | 74 |
| 64.91 | 88 |
| 64.93 | 90 |
| 64.95 | 99 |
| 64.97 | 81 |
| 64.99 | 93 |
| 65.01 | 77 |
| 65.03 | 97 |
| 65.05 | 105 |
| 65.07 | 96 |
| 65.09 | 79 |
| 65.11 | 90 |
| 65.13 | 88 |
| 65.15 | 70 |
| 65.17 | 92 |
| 65.19 | 88 |
| 65.21 | 90 |
| 65.23 | 81 |
| 65.25 | 95 |
| 65.27 | 82 |
| 65.29 | 87 |
| 65.31 | 88 |
| 65.33 | 96 |
| 65.35 | 99 |
| 65.37 | 107 |
| 65.39 | 92 |
| 65.41 | 77 |
| 65.43 | 86 |
| 65.45 | 81 |
| 65.47 | 103 |
| 65.49 | 85 |
| 65.51 | 88 |
| 65.53 | 75 |
| 65.55 | 90 |
| 65.57 | 97 |
| 65.59 | 81 |
| 65.61 | 80 |
| 65.63 | 87 |
| 65.65 | 76 |
| 65.67 | 78 |
| 65.69 | 72 |
| 65.71 | 83 |
| 65.73 | 83 |
| 65.75 | 93 |
| 65.77 | 80 |
| 65.79 | 89 |
| 65.81 | 88 |
| 65.83 | 93 |
| 65.85 | 94 |
| 65.87 | 91 |
| 65.89 | 93 |
| 65.91 | 110 |
| 65.93 | 100 |
| 65.95 | 97 |
| 65.97 | 94 |
| 65.99 | 87 |
| 66.01 | 90 |
| 66.03 | 119 |
| 66.05 | 106 |
| 66.07 | 135 |
| 66.09 | 147 |
| 66.11 | 177 |
| 66.13 | 173 |
| 66.15 | 203 |
| 66.17 | 224 |
| 66.19 | 188 |
| 66.21 | 195 |
| 66.23 | 138 |
| 66.25 | 150 |
| 66.27 | 171 |
| 66.29 | 128 |
| 66.31 | 144 |
| 66.33 | 150 |
| 66.35 | 137 |
| 66.37 | 143 |
| 66.39 | 124 |
| 66.41 | 122 |
| 66.43 | 127 |
| 66.45 | 109 |
| 66.47 | 91 |
| 66.49 | 72 |
| 66.51 | 80 |
| 66.53 | 73 |
| 66.55 | 89 |
| 66.57 | 115 |
| 66.59 | 94 |
| 66.61 | 60 |
| 66.63 | 95 |
| 66.65 | 66 |
| 66.67 | 104 |
| 66.69 | 76 |
| 66.71 | 84 |
| 66.73 | 78 |
| 66.75 | 89 |
| 66.77 | 69 |
| 66.79 | 74 |
| 66.81 | 75 |
| 66.83 | 93 |
| 66.85 | 89 |
| 66.87 | 73 |
| 66.89 | 85 |
| 66.91 | 77 |
| 66.93 | 91 |
| 66.95 | 94 |
| 66.97 | 87 |
| 66.99 | 86 |
| 67.01 | 78 |
| 67.03 | 78 |
| 67.05 | 64 |
| 67.07 | 74 |
| 67.09 | 77 |
| 67.11 | 80 |
| 67.13 | 71 |
| 67.15 | 80 |
| 67.17 | 84 |
| 67.19 | 74 |
| 67.21 | 90 |
| 67.23 | 78 |
| 67.25 | 87 |
| 67.27 | 81 |
| 67.29 | 69 |
| 67.31 | 85 |
| 67.33 | 67 |
| 67.35 | 76 |
| 67.37 | 81 |
| 67.39 | 88 |
| 67.41 | 71 |
| 67.43 | 83 |
| 67.45 | 75 |
| 67.47 | 71 |
| 67.49 | 78 |
| 67.51 | 75 |
| 67.53 | 91 |
| 67.55 | 74 |
| 67.57 | 77 |
| 67.59 | 88 |
| 67.61 | 102 |
| 67.63 | 79 |
| 67.65 | 81 |
| 67.67 | 84 |
| 67.69 | 108 |
| 67.71 | 93 |
| 67.73 | 122 |
| 67.75 | 140 |
| 67.77 | 156 |
| 67.79 | 180 |
| 67.81 | 236 |
| 67.83 | 264 |
| 67.85 | 272 |
| 67.87 | 272 |
| 67.89 | 295 |
| 67.91 | 231 |
| 67.93 | 207 |
| 67.95 | 181 |
| 67.97 | 161 |
| 67.99 | 164 |
| 68.01 | 190 |
| 68.03 | 176 |
| 68.05 | 196 |
| 68.07 | 166 |
| 68.09 | 164 |
| 68.11 | 109 |
| 68.13 | 103 |
| 68.15 | 91 |
| 68.17 | 93 |
| 68.19 | 91 |
| 68.21 | 91 |
| 68.23 | 79 |
| 68.25 | 83 |
| 68.27 | 105 |
| 68.29 | 95 |
| 68.31 | 81 |
| 68.33 | 73 |
| 68.35 | 71 |
| 68.37 | 83 |
| 68.39 | 67 |
| 68.41 | 74 |
| 68.43 | 74 |
| 68.45 | 91 |
| 68.47 | 70 |
| 68.49 | 83 |
| 68.51 | 80 |
| 68.53 | 86 |
| 68.55 | 84 |
| 68.57 | 87 |
| 68.59 | 62 |
| 68.61 | 64 |
| 68.63 | 80 |
| 68.65 | 82 |
| 68.67 | 96 |
| 68.69 | 66 |
| 68.71 | 96 |
| 68.73 | 71 |
| 68.75 | 78 |
| 68.77 | 70 |
| 68.79 | 83 |
| 68.81 | 79 |
| 68.83 | 73 |
| 68.85 | 79 |
| 68.87 | 88 |
| 68.89 | 78 |
| 68.91 | 85 |
| 68.93 | 72 |
| 68.95 | 86 |
| 68.97 | 75 |
| 68.99 | 71 |
| 69.01 | 62 |
| 69.03 | 88 |
| 69.05 | 71 |
| 69.07 | 80 |
| 69.09 | 78 |
| 69.11 | 70 |
| 69.13 | 73 |
| 69.15 | 42 |
| 69.17 | 62 |
| 69.19 | 79 |
| 69.21 | 76 |
| 69.23 | 74 |
| 69.25 | 61 |
| 69.27 | 55 |
| 69.29 | 79 |
| 69.31 | 77 |
| 69.33 | 86 |
| 69.35 | 78 |
| 69.37 | 76 |
| 69.39 | 71 |
| 69.41 | 95 |
| 69.43 | 80 |
| 69.45 | 80 |
| 69.47 | 72 |
| 69.49 | 81 |
| 69.51 | 79 |
| 69.53 | 82 |
| 69.55 | 70 |
| 69.57 | 70 |
| 69.59 | 74 |
| 69.61 | 67 |
| 69.63 | 66 |
| 69.65 | 85 |
| 69.67 | 71 |
| 69.69 | 70 |
| 69.71 | 65 |
| 69.73 | 87 |
| 69.75 | 83 |
| 69.77 | 74 |
| 69.79 | 85 |
| 69.81 | 89 |
| 69.83 | 48 |
| 69.85 | 76 |
| 69.87 | 76 |
| 69.89 | 69 |
| 69.91 | 86 |
| 69.93 | 89 |
| 69.95 | 71 |
| 69.97 | 87 |
| 69.99 | 84 |
| 70.01 | 76 |
| 70.03 | 91 |
| 70.05 | 79 |
| 70.07 | 87 |
| 70.09 | 74 |
| 70.11 | 86 |
| 70.13 | 78 |
| 70.15 | 94 |
| 70.17 | 77 |
| 70.19 | 77 |
| 70.21 | 70 |
| 70.23 | 72 |
| 70.25 | 88 |
| 70.27 | 93 |
| 70.29 | 69 |
| 70.31 | 71 |
| 70.33 | 85 |
| 70.35 | 77 |
| 70.37 | 74 |
| 70.39 | 68 |
| 70.41 | 71 |
| 70.43 | 70 |
| 70.45 | 66 |
| 70.47 | 74 |
| 70.49 | 61 |
| 70.51 | 73 |
| 70.53 | 94 |
| 70.55 | 54 |
| 70.57 | 55 |
| 70.59 | 65 |
| 70.61 | 70 |
| 70.63 | 62 |
| 70.65 | 73 |
| 70.67 | 74 |
| 70.69 | 81 |
| 70.71 | 82 |
| 70.73 | 71 |
| 70.75 | 67 |
| 70.77 | 92 |
| 70.79 | 61 |
| 70.81 | 71 |
| 70.83 | 67 |
| 70.85 | 80 |
| 70.87 | 76 |
| 70.89 | 80 |
| 70.91 | 70 |
| 70.93 | 69 |
| 70.95 | 79 |
| 70.97 | 82 |
| 70.99 | 71 |
| 71.01 | 72 |
| 71.03 | 74 |
| 71.05 | 62 |
| 71.07 | 69 |
| 71.09 | 66 |
| 71.11 | 65 |
| 71.13 | 70 |
| 71.15 | 67 |
| 71.17 | 79 |
| 71.19 | 76 |
| 71.21 | 57 |
| 71.23 | 66 |
| 71.25 | 65 |
| 71.27 | 73 |
| 71.29 | 61 |
| 71.31 | 72 |
| 71.33 | 67 |
| 71.35 | 72 |
| 71.37 | 77 |
| 71.39 | 77 |
| 71.41 | 66 |
| 71.43 | 60 |
| 71.45 | 72 |
| 71.47 | 65 |
| 71.49 | 59 |
| 71.51 | 72 |
| 71.53 | 62 |
| 71.55 | 68 |
| 71.57 | 76 |
| 71.59 | 71 |
| 71.61 | 63 |
| 71.63 | 63 |
| 71.65 | 68 |
| 71.67 | 83 |
| 71.69 | 83 |
| 71.71 | 77 |
| 71.73 | 69 |
| 71.75 | 67 |
| 71.77 | 77 |
| 71.79 | 77 |
| 71.81 | 74 |
| 71.83 | 59 |
| 71.85 | 74 |
| 71.87 | 100 |
| 71.89 | 52 |
| 71.91 | 65 |
| 71.93 | 86 |
| 71.95 | 59 |
| 71.97 | 70 |
| 71.99 | 64 |
| 72.01 | 68 |
| 72.03 | 42 |
| 72.05 | 61 |
| 72.07 | 64 |
| 72.09 | 62 |
| 72.11 | 79 |
| 72.13 | 71 |
| 72.15 | 73 |
| 72.17 | 77 |
| 72.19 | 85 |
| 72.21 | 74 |
| 72.23 | 70 |
| 72.25 | 79 |
| 72.27 | 78 |
| 72.29 | 66 |
| 72.31 | 76 |
| 72.33 | 67 |
| 72.35 | 69 |
| 72.37 | 74 |
| 72.39 | 79 |
| 72.41 | 64 |
| 72.43 | 59 |
| 72.45 | 59 |
| 72.47 | 74 |
| 72.49 | 74 |
| 72.51 | 66 |
| 72.53 | 69 |
| 72.55 | 71 |
| 72.57 | 76 |
| 72.59 | 66 |
| 72.61 | 67 |
| 72.63 | 79 |
| 72.65 | 81 |
| 72.67 | 60 |
| 72.69 | 75 |
| 72.71 | 70 |
| 72.73 | 76 |
| 72.75 | 75 |
| 72.77 | 65 |
| 72.79 | 72 |
| 72.81 | 77 |
| 72.83 | 65 |
| 72.85 | 67 |
| 72.87 | 84 |
| 72.89 | 64 |
| 72.91 | 64 |
| 72.93 | 73 |
| 72.95 | 64 |
| 72.97 | 61 |
| 72.99 | 71 |
| 73.01 | 66 |
| 73.03 | 61 |
| 73.05 | 65 |
| 73.07 | 67 |
| 73.09 | 65 |
| 73.11 | 88 |
| 73.13 | 63 |
| 73.15 | 75 |
| 73.17 | 56 |
| 73.19 | 65 |
| 73.21 | 64 |
| 73.23 | 67 |
| 73.25 | 59 |
| 73.27 | 55 |
| 73.29 | 61 |
| 73.31 | 77 |
| 73.33 | 69 |
| 73.35 | 57 |
| 73.37 | 46 |
| 73.39 | 76 |
| 73.41 | 67 |
| 73.43 | 77 |
| 73.45 | 75 |
| 73.47 | 59 |
| 73.49 | 57 |
| 73.51 | 73 |
| 73.53 | 75 |
| 73.55 | 75 |
| 73.57 | 72 |
| 73.59 | 71 |
| 73.61 | 68 |
| 73.63 | 67 |
| 73.65 | 75 |
| 73.67 | 66 |
| 73.69 | 77 |
| 73.71 | 74 |
| 73.73 | 78 |
| 73.75 | 80 |
| 73.77 | 85 |
| 73.79 | 56 |
| 73.81 | 97 |
| 73.83 | 88 |
| 73.85 | 86 |
| 73.87 | 74 |
| 73.89 | 85 |
| 73.91 | 77 |
| 73.93 | 76 |
| 73.95 | 75 |
| 73.97 | 62 |
| 73.99 | 82 |
| 74.01 | 79 |
| 74.03 | 77 |
| 74.05 | 64 |
| 74.07 | 58 |
| 74.09 | 83 |
| 74.11 | 66 |
| 74.13 | 93 |
| 74.15 | 78 |
| 74.17 | 75 |
| 74.19 | 76 |
| 74.21 | 73 |
| 74.23 | 57 |
| 74.25 | 62 |
| 74.27 | 70 |
| 74.29 | 85 |
| 74.31 | 81 |
| 74.33 | 82 |
| 74.35 | 78 |
| 74.37 | 77 |
| 74.39 | 89 |
| 74.41 | 86 |
| 74.43 | 68 |
| 74.45 | 81 |
| 74.47 | 93 |
| 74.49 | 64 |
| 74.51 | 71 |
| 74.53 | 76 |
| 74.55 | 65 |
| 74.57 | 69 |
| 74.59 | 69 |
| 74.61 | 94 |
| 74.63 | 70 |
| 74.65 | 75 |
| 74.67 | 83 |
| 74.69 | 65 |
| 74.71 | 78 |
| 74.73 | 66 |
| 74.75 | 84 |
| 74.77 | 73 |
| 74.79 | 68 |
| 74.81 | 72 |
| 74.83 | 66 |
| 74.85 | 71 |
| 74.87 | 73 |
| 74.89 | 65 |
| 74.91 | 91 |
| 74.93 | 71 |
| 74.95 | 71 |
| 74.97 | 55 |
| 74.99 | 64 |
| 75.01 | 61 |
| 75.03 | 87 |
| 75.05 | 69 |
| 75.07 | 87 |
| 75.09 | 88 |
| 75.11 | 74 |
| 75.13 | 57 |
| 75.15 | 81 |
| 75.17 | 67 |
| 75.19 | 74 |
| 75.21 | 72 |
| 75.23 | 75 |
| 75.25 | 81 |
| 75.27 | 77 |
| 75.29 | 79 |
| 75.31 | 75 |
| 75.33 | 69 |
| 75.35 | 66 |
| 75.37 | 96 |
| 75.39 | 81 |
| 75.41 | 74 |
| 75.43 | 64 |
| 75.45 | 75 |
| 75.47 | 69 |
| 75.49 | 81 |
| 75.51 | 83 |
| 75.53 | 65 |
| 75.55 | 76 |
| 75.57 | 63 |
| 75.59 | 63 |
| 75.61 | 73 |
| 75.63 | 74 |
| 75.65 | 61 |
| 75.67 | 71 |
| 75.69 | 65 |
| 75.71 | 76 |
| 75.73 | 72 |
| 75.75 | 75 |
| 75.77 | 77 |
| 75.79 | 82 |
| 75.81 | 72 |
| 75.83 | 86 |
| 75.85 | 83 |
| 75.87 | 86 |
| 75.89 | 88 |
| 75.91 | 68 |
| 75.93 | 81 |
| 75.95 | 63 |
| 75.97 | 74 |
| 75.99 | 86 |
| 76.01 | 75 |
| 76.03 | 66 |
| 76.05 | 77 |
| 76.07 | 65 |
| 76.09 | 75 |
| 76.11 | 88 |
| 76.13 | 81 |
| 76.15 | 78 |
| 76.17 | 80 |
| 76.19 | 88 |
| 76.21 | 86 |
| 76.23 | 91 |
| 76.25 | 72 |
| 76.27 | 97 |
| 76.29 | 82 |
| 76.31 | 69 |
| 76.33 | 78 |
| 76.35 | 80 |
| 76.37 | 90 |
| 76.39 | 84 |
| 76.41 | 94 |
| 76.43 | 107 |
| 76.45 | 134 |
| 76.47 | 151 |
| 76.49 | 155 |
| 76.51 | 166 |
| 76.53 | 147 |
| 76.55 | 136 |
| 76.57 | 149 |
| 76.59 | 132 |
| 76.61 | 107 |
| 76.63 | 123 |
| 76.65 | 127 |
| 76.67 | 119 |
| 76.69 | 123 |
| 76.71 | 115 |
| 76.73 | 144 |
| 76.75 | 134 |
| 76.77 | 142 |
| 76.79 | 148 |
| 76.81 | 144 |
| 76.83 | 139 |
| 76.85 | 127 |
| 76.87 | 166 |
| 76.89 | 158 |
| 76.91 | 168 |
| 76.93 | 185 |
| 76.95 | 146 |
| 76.97 | 165 |
| 76.99 | 159 |
| 77.01 | 169 |
| 77.03 | 165 |
| 77.05 | 181 |
| 77.07 | 193 |
| 77.09 | 223 |
| 77.11 | 278 |
| 77.13 | 295 |
| 77.15 | 346 |
| 77.17 | 377 |
| 77.19 | 461 |
| 77.21 | 503 |
| 77.23 | 588 |
| 77.25 | 609 |
| 77.27 | 796 |
| 77.29 | 839 |
| 77.31 | 997 |
| 77.33 | 1117 |
| 77.35 | 1091 |
| 77.37 | 1275 |
| 77.39 | 1276 |
| 77.41 | 1403 |
| 77.43 | 1399 |
| 77.45 | 1480 |
| 77.47 | 1475 |
| 77.49 | 1423 |
| 77.51 | 1293 |
| 77.53 | 1292 |
| 77.55 | 1216 |
| 77.57 | 1109 |
| 77.59 | 1016 |
| 77.61 | 1045 |
| 77.63 | 1000 |
| 77.65 | 980 |
| 77.67 | 831 |
| 77.69 | 814 |
| 77.71 | 785 |
| 77.73 | 694 |
| 77.75 | 587 |
| 77.77 | 544 |
| 77.79 | 465 |
| 77.81 | 449 |
| 77.83 | 407 |
| 77.85 | 383 |
| 77.87 | 365 |
| 77.89 | 275 |
| 77.91 | 301 |
| 77.93 | 293 |
| 77.95 | 242 |
| 77.97 | 252 |
| 77.99 | 226 |
| 78.01 | 204 |
| 78.03 | 212 |
| 78.05 | 212 |
| 78.07 | 207 |
| 78.09 | 170 |
| 78.11 | 178 |
| 78.13 | 169 |
| 78.15 | 164 |
| 78.17 | 165 |
| 78.19 | 177 |
| 78.21 | 153 |
| 78.23 | 161 |
| 78.25 | 151 |
| 78.27 | 147 |
| 78.29 | 144 |
| 78.31 | 133 |
| 78.33 | 146 |
| 78.35 | 147 |
| 78.37 | 129 |
| 78.39 | 128 |
| 78.41 | 129 |
| 78.43 | 153 |
| 78.45 | 135 |
| 78.47 | 124 |
| 78.49 | 135 |
| 78.51 | 129 |
| 78.53 | 129 |
| 78.55 | 138 |
| 78.57 | 125 |
| 78.59 | 134 |
| 78.61 | 123 |
| 78.63 | 118 |
| 78.65 | 119 |
| 78.67 | 138 |
| 78.69 | 126 |
| 78.71 | 114 |
| 78.73 | 121 |
| 78.75 | 106 |
| 78.77 | 130 |
| 78.79 | 92 |
| 78.81 | 109 |
| 78.83 | 113 |
| 78.85 | 104 |
| 78.87 | 118 |
| 78.89 | 115 |
| 78.91 | 121 |
| 78.93 | 119 |
| 78.95 | 96 |
| 78.97 | 129 |
| 78.99 | 116 |
| 79.01 | 124 |
| 79.03 | 110 |
| 79.05 | 95 |
| 79.07 | 101 |
| 79.09 | 112 |
| 79.11 | 96 |
| 79.13 | 110 |
| 79.15 | 115 |
| 79.17 | 109 |
| 79.19 | 109 |
| 79.21 | 94 |
| 79.23 | 117 |
| 79.25 | 120 |
| 79.27 | 113 |
| 79.29 | 104 |
| 79.31 | 103 |
| 79.33 | 128 |
| 79.35 | 109 |
| 79.37 | 125 |
| 79.39 | 90 |
| 79.41 | 121 |
| 79.43 | 107 |
| 79.45 | 114 |
| 79.47 | 126 |
| 79.49 | 109 |
| 79.51 | 95 |
| 79.53 | 95 |
| 79.55 | 106 |
| 79.57 | 111 |
| 79.59 | 101 |
| 79.61 | 108 |
| 79.63 | 109 |
| 79.65 | 121 |
| 79.67 | 121 |
| 79.69 | 112 |
| 79.71 | 113 |
| 79.73 | 105 |
| 79.75 | 117 |
| 79.77 | 109 |
| 79.79 | 119 |
| 79.81 | 113 |
| 79.83 | 103 |
| 79.85 | 113 |
| 79.87 | 107 |
| 79.89 | 108 |
| 79.91 | 118 |
| 79.93 | 119 |
| 79.95 | 101 |
| 79.97 | 126 |
| 79.99 | 110 |
| 80.01 | 121 |
| 80.03 | 100 |
| 80.05 | 121 |
| 80.07 | 114 |
| 80.09 | 108 |
| 80.11 | 107 |
| 80.13 | 102 |
| 80.15 | 138 |
| 80.17 | 122 |
| 80.19 | 100 |
| 80.21 | 125 |
| 80.23 | 127 |
| 80.25 | 112 |
| 80.27 | 125 |
| 80.29 | 124 |
| 80.31 | 131 |
| 80.33 | 134 |
| 80.35 | 134 |
| 80.37 | 155 |
| 80.39 | 137 |
| 80.41 | 155 |
| 80.43 | 137 |
| 80.45 | 142 |
| 80.47 | 127 |
| 80.49 | 138 |
| 80.51 | 133 |
| 80.53 | 146 |
| 80.55 | 137 |
| 80.57 | 153 |
| 80.59 | 129 |
| 80.61 | 145 |
| 80.63 | 136 |
| 80.65 | 149 |
| 80.67 | 126 |
| 80.69 | 130 |
| 80.71 | 133 |
| 80.73 | 128 |
| 80.75 | 120 |
| 80.77 | 128 |
| 80.79 | 143 |
| 80.81 | 128 |
| 80.83 | 133 |
| 80.85 | 125 |
| 80.87 | 114 |
| 80.89 | 109 |
| 80.91 | 133 |
| 80.93 | 126 |
| 80.95 | 118 |
| 80.97 | 118 |
| 80.99 | 124 |
| 81.01 | 118 |
| 81.03 | 124 |
| 81.05 | 125 |
| 81.07 | 142 |
| 81.09 | 126 |
| 81.11 | 132 |
| 81.13 | 144 |
| 81.15 | 132 |
| 81.17 | 123 |
| 81.19 | 143 |
| 81.21 | 146 |
| 81.23 | 113 |
| 81.25 | 146 |
| 81.27 | 125 |
| 81.29 | 127 |
| 81.31 | 156 |
| 81.33 | 131 |
| 81.35 | 142 |
| 81.37 | 130 |
| 81.39 | 149 |
| 81.41 | 142 |
| 81.43 | 129 |
| 81.45 | 151 |
| 81.47 | 167 |
| 81.49 | 130 |
| 81.51 | 137 |
| 81.53 | 181 |
| 81.55 | 173 |
| 81.57 | 142 |
| 81.59 | 145 |
| 81.61 | 135 |
| 81.63 | 160 |
| 81.65 | 157 |
| 81.67 | 157 |
| 81.69 | 154 |
| 81.71 | 147 |
| 81.73 | 164 |
| 81.75 | 186 |
| 81.77 | 175 |
| 81.79 | 150 |
| 81.81 | 174 |
| 81.83 | 182 |
| 81.85 | 175 |
| 81.87 | 169 |
| 81.89 | 189 |
| 81.91 | 206 |
| 81.93 | 177 |
| 81.95 | 189 |
| 81.97 | 169 |
| 81.99 | 195 |
| 82.01 | 176 |
| 82.03 | 202 |
| 82.05 | 193 |
| 82.07 | 184 |
| 82.09 | 203 |
| 82.11 | 205 |
| 82.13 | 169 |
| 82.15 | 189 |
| 82.17 | 195 |
| 82.19 | 197 |
| 82.21 | 240 |
| 82.23 | 226 |
| 82.25 | 200 |
| 82.27 | 237 |
| 82.29 | 241 |
| 82.31 | 251 |
| 82.33 | 245 |
| 82.35 | 237 |
| 82.37 | 230 |
| 82.39 | 244 |
| 82.41 | 261 |
| 82.43 | 249 |
| 82.45 | 265 |
| 82.47 | 295 |
| 82.49 | 267 |
| 82.51 | 284 |
| 82.53 | 275 |
| 82.55 | 300 |
| 82.57 | 318 |
| 82.59 | 276 |
| 82.61 | 311 |
| 82.63 | 313 |
| 82.65 | 317 |
| 82.67 | 304 |
| 82.69 | 323 |
| 82.71 | 318 |
| 82.73 | 363 |
| 82.75 | 350 |
| 82.77 | 376 |
| 82.79 | 337 |
| 82.81 | 319 |
| 82.83 | 357 |
| 82.85 | 400 |
| 82.87 | 393 |
| 82.89 | 384 |
| 82.91 | 453 |
| 82.93 | 378 |
| 82.95 | 383 |
| 82.97 | 405 |
| 82.99 | 437 |
| 83.01 | 394 |
| 83.03 | 467 |
| 83.05 | 477 |
| 83.07 | 461 |
| 83.09 | 474 |
| 83.11 | 464 |
| 83.13 | 457 |
| 83.15 | 471 |
| 83.17 | 495 |
| 83.19 | 496 |
| 83.21 | 502 |
| 83.23 | 499 |
| 83.25 | 551 |
| 83.27 | 529 |
| 83.29 | 552 |
| 83.31 | 545 |
| 83.33 | 533 |
| 83.35 | 564 |
| 83.37 | 532 |
| 83.39 | 577 |
| 83.41 | 566 |
| 83.43 | 576 |
| 83.45 | 489 |
| 83.47 | 597 |
| 83.49 | 580 |
| 83.51 | 606 |
| 83.53 | 585 |
| 83.55 | 549 |
| 83.57 | 524 |
| 83.59 | 601 |
| 83.61 | 503 |
| 83.63 | 558 |
| 83.65 | 604 |
| 83.67 | 529 |
| 83.69 | 509 |
| 83.71 | 551 |
| 83.73 | 530 |
| 83.75 | 581 |
| 83.77 | 492 |
| 83.79 | 534 |
| 83.81 | 554 |
| 83.83 | 497 |
| 83.85 | 486 |
| 83.87 | 508 |
| 83.89 | 521 |
| 83.91 | 483 |
| 83.93 | 468 |
| 83.95 | 472 |
| 83.97 | 467 |
| 83.99 | 498 |
| 84.01 | 476 |
| 84.03 | 521 |
| 84.05 | 443 |
| 84.07 | 492 |
| 84.09 | 404 |
| 84.11 | 434 |
| 84.13 | 428 |
| 84.15 | 386 |
| 84.17 | 415 |
| 84.19 | 377 |
| 84.21 | 397 |
| 84.23 | 360 |
| 84.25 | 398 |
| 84.27 | 393 |
| 84.29 | 368 |
| 84.31 | 390 |
| 84.33 | 333 |
| 84.35 | 342 |
| 84.37 | 331 |
| 84.39 | 322 |
| 84.41 | 325 |
| 84.43 | 322 |
| 84.45 | 296 |
| 84.47 | 291 |
| 84.49 | 304 |
| 84.51 | 312 |
| 84.53 | 305 |
| 84.55 | 268 |
| 84.57 | 280 |
| 84.59 | 264 |
| 84.61 | 273 |
| 84.63 | 254 |
| 84.65 | 267 |
| 84.67 | 242 |
| 84.69 | 225 |
| 84.71 | 259 |
| 84.73 | 260 |
| 84.75 | 235 |
| 84.77 | 258 |
| 84.79 | 235 |
| 84.81 | 233 |
| 84.83 | 239 |
| 84.85 | 220 |
| 84.87 | 238 |
| 84.89 | 187 |
| 84.91 | 240 |
| 84.93 | 206 |
| 84.95 | 209 |
| 84.97 | 198 |
| 84.99 | 194 |
| 85.01 | 223 |
| 85.03 | 212 |
| 85.05 | 177 |
| 85.07 | 213 |
| 85.09 | 179 |
| 85.11 | 207 |
| 85.13 | 195 |
| 85.15 | 188 |
| 85.17 | 189 |
| 85.19 | 203 |
| 85.21 | 185 |
| 85.23 | 189 |
| 85.25 | 148 |
| 85.27 | 181 |
| 85.29 | 166 |
| 85.31 | 171 |
| 85.33 | 212 |
| 85.35 | 146 |
| 85.37 | 173 |
| 85.39 | 173 |
| 85.41 | 181 |
| 85.43 | 161 |
| 85.45 | 183 |
| 85.47 | 170 |
| 85.49 | 166 |
| 85.51 | 179 |
| 85.53 | 174 |
| 85.55 | 189 |
| 85.57 | 186 |
| 85.59 | 162 |
| 85.61 | 150 |
| 85.63 | 186 |
| 85.65 | 161 |
| 85.67 | 165 |
| 85.69 | 201 |
| 85.71 | 180 |
| 85.73 | 172 |
| 85.75 | 155 |
| 85.77 | 166 |
| 85.79 | 173 |
| 85.81 | 150 |
| 85.83 | 180 |
| 85.85 | 165 |
| 85.87 | 160 |
| 85.89 | 176 |
| 85.91 | 187 |
| 85.93 | 164 |
| 85.95 | 205 |
| 85.97 | 185 |
| 85.99 | 200 |
| 86.01 | 213 |
| 86.03 | 209 |
| 86.05 | 194 |
| 86.07 | 216 |
| 86.09 | 232 |
| 86.11 | 202 |
| 86.13 | 213 |
| 86.15 | 210 |
| 86.17 | 213 |
| 86.19 | 215 |
| 86.21 | 242 |
| 86.23 | 226 |
| 86.25 | 229 |
| 86.27 | 236 |
| 86.29 | 215 |
| 86.31 | 203 |
| 86.33 | 222 |
| 86.35 | 243 |
| 86.37 | 221 |
| 86.39 | 195 |
| 86.41 | 203 |
| 86.43 | 234 |
| 86.45 | 235 |
| 86.47 | 232 |
| 86.49 | 222 |
| 86.51 | 226 |
| 86.53 | 190 |
| 86.55 | 212 |
| 86.57 | 190 |
| 86.59 | 212 |
| 86.61 | 229 |
| 86.63 | 205 |
| 86.65 | 232 |
| 86.67 | 209 |
| 86.69 | 199 |
| 86.71 | 202 |
| 86.73 | 203 |
| 86.75 | 177 |
| 86.77 | 188 |
| 86.79 | 179 |
| 86.81 | 196 |
| 86.83 | 189 |
| 86.85 | 167 |
| 86.87 | 173 |
| 86.89 | 178 |
| 86.91 | 149 |
| 86.93 | 153 |
| 86.95 | 135 |
| 86.97 | 155 |
| 86.99 | 144 |
| 87.01 | 157 |
| 87.03 | 156 |
| 87.05 | 138 |
| 87.07 | 120 |
| 87.09 | 151 |
| 87.11 | 145 |
| 87.13 | 138 |
| 87.15 | 154 |
| 87.17 | 123 |
| 87.19 | 109 |
| 87.21 | 111 |
| 87.23 | 134 |
| 87.25 | 120 |
| 87.27 | 145 |
| 87.29 | 111 |
| 87.31 | 94 |
| 87.33 | 113 |
| 87.35 | 126 |
| 87.37 | 98 |
| 87.39 | 96 |
| 87.41 | 107 |
| 87.43 | 94 |
| 87.45 | 110 |
| 87.47 | 103 |
| 87.49 | 95 |
| 87.51 | 127 |
| 87.53 | 108 |
| 87.55 | 90 |
| 87.57 | 90 |
| 87.59 | 99 |
| 87.61 | 87 |
| 87.63 | 95 |
| 87.65 | 104 |
| 87.67 | 92 |
| 87.69 | 88 |
| 87.71 | 86 |
| 87.73 | 100 |
| 87.75 | 93 |
| 87.77 | 86 |
| 87.79 | 101 |
| 87.81 | 91 |
| 87.83 | 102 |
| 87.85 | 86 |
| 87.87 | 90 |
| 87.89 | 94 |
| 87.91 | 103 |
| 87.93 | 94 |
| 87.95 | 82 |
| 87.97 | 82 |
| 87.99 | 89 |
| 88.01 | 79 |
| 88.03 | 82 |
| 88.05 | 81 |
| 88.07 | 84 |
| 88.09 | 84 |
| 88.11 | 82 |
| 88.13 | 78 |
| 88.15 | 74 |
| 88.17 | 77 |
| 88.19 | 87 |
| 88.21 | 82 |
| 88.23 | 81 |
| 88.25 | 90 |
| 88.27 | 93 |
| 88.29 | 84 |
| 88.31 | 107 |
| 88.33 | 71 |
| 88.35 | 95 |
| 88.37 | 99 |
| 88.39 | 76 |
| 88.41 | 79 |
| 88.43 | 89 |
| 88.45 | 92 |
| 88.47 | 89 |
| 88.49 | 82 |
| 88.51 | 93 |
| 88.53 | 76 |
| 88.55 | 65 |
| 88.57 | 90 |
| 88.59 | 104 |
| 88.61 | 113 |
| 88.63 | 121 |
| 88.65 | 126 |
| 88.67 | 143 |
| 88.69 | 124 |
| 88.71 | 105 |
| 88.73 | 115 |
| 88.75 | 106 |
| 88.77 | 107 |
| 88.79 | 101 |
| 88.81 | 94 |
| 88.83 | 81 |
| 88.85 | 74 |
| 88.87 | 98 |
| 88.89 | 89 |
| 88.91 | 95 |
| 88.93 | 90 |
| 88.95 | 96 |
| 88.97 | 74 |
| 88.99 | 102 |
| 89.01 | 82 |
| 89.03 | 86 |
| 89.05 | 89 |
| 89.07 | 83 |
| 89.09 | 78 |
| 89.11 | 71 |
| 89.13 | 79 |
| 89.15 | 71 |
| 89.17 | 89 |
| 89.19 | 61 |
| 89.21 | 73 |
| 89.23 | 73 |
| 89.25 | 77 |
| 89.27 | 62 |
| 89.29 | 60 |
| 89.31 | 65 |
| 89.33 | 69 |
| 89.35 | 69 |
| 89.37 | 71 |
| 89.39 | 78 |
| 89.41 | 62 |
| 89.43 | 66 |
| 89.45 | 75 |
| 89.47 | 82 |
| 89.49 | 73 |
| 89.51 | 85 |
| 89.53 | 73 |
| 89.55 | 68 |
| 89.57 | 81 |
| 89.59 | 62 |
| 89.61 | 57 |
| 89.63 | 55 |
| 89.65 | 78 |
| 89.67 | 72 |
| 89.69 | 67 |
| 89.71 | 75 |
| 89.73 | 72 |
| 89.75 | 85 |
| 89.77 | 64 |
| 89.79 | 75 |
| 89.81 | 77 |
| 89.83 | 71 |
| 89.85 | 81 |
| 89.87 | 64 |
| 89.89 | 78 |
| 89.91 | 67 |
| 89.93 | 65 |
| 89.95 | 62 |
| 89.97 | 55 |
| 89.99 | 63 |